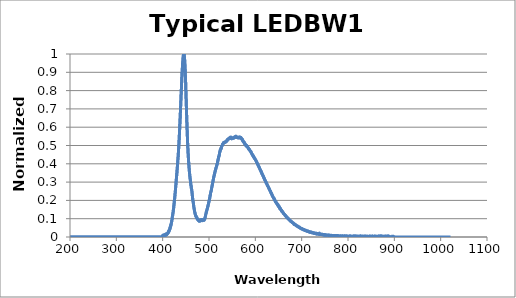
| Category | Normalized Intensity |
|---|---|
| 196.74042 | 0 |
| 196.94817 | 0 |
| 197.15593 | 0 |
| 197.36369 | 0 |
| 197.57147 | 0 |
| 197.77927 | 0 |
| 197.98708 | 0 |
| 198.19489 | 0 |
| 198.40271 | 0 |
| 198.61053 | 0 |
| 198.81839 | 0 |
| 199.02625 | 0 |
| 199.2341 | 0 |
| 199.44199 | 0 |
| 199.64987 | 0 |
| 199.85777 | 0 |
| 200.06567 | 0 |
| 200.27359 | 0 |
| 200.48152 | 0 |
| 200.68947 | 0 |
| 200.89742 | 0 |
| 201.10538 | 0 |
| 201.31335 | 0 |
| 201.52133 | 0 |
| 201.72932 | 0 |
| 201.93733 | 0 |
| 202.14536 | 0 |
| 202.35338 | 0 |
| 202.56142 | 0 |
| 202.76945 | 0 |
| 202.97751 | 0 |
| 203.18558 | 0 |
| 203.39366 | 0 |
| 203.60175 | 0 |
| 203.80985 | 0 |
| 204.01796 | 0 |
| 204.22607 | 0 |
| 204.43422 | 0 |
| 204.64235 | 0 |
| 204.85051 | 0 |
| 205.05867 | 0 |
| 205.26685 | 0 |
| 205.47504 | 0 |
| 205.68323 | 0 |
| 205.89143 | 0 |
| 206.09964 | 0 |
| 206.30788 | 0 |
| 206.51611 | 0 |
| 206.72437 | 0 |
| 206.93262 | 0 |
| 207.14088 | 0 |
| 207.34917 | 0 |
| 207.55746 | 0 |
| 207.76576 | 0 |
| 207.97408 | 0 |
| 208.18239 | 0 |
| 208.39073 | 0 |
| 208.59908 | 0 |
| 208.80743 | 0 |
| 209.01579 | 0 |
| 209.22417 | 0 |
| 209.43256 | 0 |
| 209.64095 | 0 |
| 209.84937 | 0 |
| 210.05777 | 0 |
| 210.2662 | 0 |
| 210.47464 | 0 |
| 210.68309 | 0 |
| 210.89156 | 0 |
| 211.10002 | 0 |
| 211.3085 | 0 |
| 211.517 | 0 |
| 211.72551 | 0 |
| 211.93402 | 0 |
| 212.14255 | 0 |
| 212.35107 | 0 |
| 212.55962 | 0 |
| 212.76817 | 0 |
| 212.97675 | 0 |
| 213.18532 | 0 |
| 213.39391 | 0 |
| 213.60251 | 0 |
| 213.81111 | 0 |
| 214.01973 | 0 |
| 214.22836 | 0 |
| 214.43701 | 0 |
| 214.64566 | 0 |
| 214.85432 | 0 |
| 215.06299 | 0 |
| 215.27167 | 0 |
| 215.48036 | 0 |
| 215.68907 | 0 |
| 215.89778 | 0 |
| 216.10651 | 0 |
| 216.31525 | 0 |
| 216.52399 | 0 |
| 216.73276 | 0 |
| 216.94151 | 0 |
| 217.1503 | 0 |
| 217.35909 | 0 |
| 217.56789 | 0 |
| 217.77669 | 0 |
| 217.98552 | 0 |
| 218.19435 | 0 |
| 218.40318 | 0 |
| 218.61205 | 0 |
| 218.82091 | 0 |
| 219.02979 | 0 |
| 219.23866 | 0 |
| 219.44756 | 0 |
| 219.65646 | 0 |
| 219.86537 | 0 |
| 220.07431 | 0 |
| 220.28325 | 0 |
| 220.49219 | 0 |
| 220.70114 | 0 |
| 220.91011 | 0 |
| 221.11909 | 0 |
| 221.32808 | 0 |
| 221.53708 | 0 |
| 221.74609 | 0 |
| 221.95512 | 0 |
| 222.16415 | 0 |
| 222.3732 | 0 |
| 222.58224 | 0 |
| 222.79131 | 0 |
| 223.00038 | 0 |
| 223.20947 | 0 |
| 223.41856 | 0 |
| 223.62767 | 0 |
| 223.83679 | 0 |
| 224.04591 | 0 |
| 224.25505 | 0 |
| 224.4642 | 0 |
| 224.67337 | 0 |
| 224.88254 | 0 |
| 225.09172 | 0 |
| 225.3009 | 0 |
| 225.5101 | 0 |
| 225.71931 | 0 |
| 225.92854 | 0 |
| 226.13777 | 0 |
| 226.34702 | 0 |
| 226.55627 | 0 |
| 226.76553 | 0 |
| 226.97481 | 0 |
| 227.1841 | 0 |
| 227.39339 | 0 |
| 227.60271 | 0 |
| 227.81201 | 0 |
| 228.02135 | 0 |
| 228.23068 | 0 |
| 228.44003 | 0 |
| 228.6494 | 0 |
| 228.85876 | 0 |
| 229.06815 | 0 |
| 229.27754 | 0 |
| 229.48694 | 0 |
| 229.69635 | 0 |
| 229.90578 | 0 |
| 230.1152 | 0 |
| 230.32466 | 0 |
| 230.5341 | 0 |
| 230.74358 | 0 |
| 230.95305 | 0 |
| 231.16254 | 0 |
| 231.37204 | 0 |
| 231.58154 | 0 |
| 231.79106 | 0 |
| 232.0006 | 0 |
| 232.21013 | 0 |
| 232.41968 | 0 |
| 232.62924 | 0 |
| 232.83881 | 0 |
| 233.04839 | 0 |
| 233.25798 | 0 |
| 233.46759 | 0 |
| 233.6772 | 0 |
| 233.88683 | 0 |
| 234.09647 | 0 |
| 234.30611 | 0 |
| 234.51576 | 0 |
| 234.72543 | 0 |
| 234.9351 | 0 |
| 235.14479 | 0 |
| 235.35449 | 0 |
| 235.56419 | 0 |
| 235.77391 | 0 |
| 235.98364 | 0 |
| 236.19339 | 0 |
| 236.40314 | 0 |
| 236.6129 | 0 |
| 236.82266 | 0 |
| 237.03246 | 0 |
| 237.24225 | 0 |
| 237.45204 | 0 |
| 237.66187 | 0 |
| 237.87169 | 0 |
| 238.08151 | 0 |
| 238.29137 | 0 |
| 238.50122 | 0 |
| 238.71109 | 0 |
| 238.92096 | 0 |
| 239.13084 | 0 |
| 239.34074 | 0 |
| 239.55066 | 0 |
| 239.76057 | 0 |
| 239.9705 | 0 |
| 240.18045 | 0 |
| 240.3904 | 0 |
| 240.60036 | 0 |
| 240.81033 | 0 |
| 241.02031 | 0 |
| 241.2303 | 0 |
| 241.44031 | 0 |
| 241.65031 | 0 |
| 241.86035 | 0 |
| 242.07037 | 0 |
| 242.28043 | 0 |
| 242.49048 | 0 |
| 242.70055 | 0 |
| 242.91063 | 0 |
| 243.12071 | 0 |
| 243.33081 | 0 |
| 243.54092 | 0 |
| 243.75104 | 0 |
| 243.96117 | 0 |
| 244.17131 | 0 |
| 244.38145 | 0 |
| 244.59163 | 0 |
| 244.80179 | 0 |
| 245.01198 | 0 |
| 245.22217 | 0 |
| 245.43237 | 0 |
| 245.64259 | 0 |
| 245.85281 | 0 |
| 246.06305 | 0 |
| 246.27328 | 0 |
| 246.48355 | 0 |
| 246.69382 | 0 |
| 246.9041 | 0 |
| 247.11438 | 0 |
| 247.32468 | 0 |
| 247.53499 | 0 |
| 247.7453 | 0 |
| 247.95564 | 0 |
| 248.16597 | 0 |
| 248.37633 | 0 |
| 248.58669 | 0 |
| 248.79706 | 0 |
| 249.00745 | 0 |
| 249.21783 | 0 |
| 249.42824 | 0 |
| 249.63866 | 0 |
| 249.84908 | 0 |
| 250.05951 | 0 |
| 250.26996 | 0 |
| 250.48041 | 0 |
| 250.69087 | 0 |
| 250.90135 | 0 |
| 251.11185 | 0 |
| 251.32234 | 0 |
| 251.53285 | 0 |
| 251.74336 | 0 |
| 251.9539 | 0 |
| 252.16444 | 0 |
| 252.37498 | 0 |
| 252.58556 | 0 |
| 252.79613 | 0 |
| 253.0067 | 0 |
| 253.2173 | 0 |
| 253.4279 | 0 |
| 253.63852 | 0 |
| 253.84914 | 0 |
| 254.05977 | 0 |
| 254.27042 | 0 |
| 254.48108 | 0 |
| 254.69174 | 0 |
| 254.90242 | 0 |
| 255.1131 | 0 |
| 255.32381 | 0 |
| 255.53452 | 0 |
| 255.74522 | 0 |
| 255.95596 | 0 |
| 256.16669 | 0 |
| 256.37744 | 0 |
| 256.5882 | 0 |
| 256.79898 | 0 |
| 257.00977 | 0 |
| 257.22055 | 0 |
| 257.43137 | 0 |
| 257.64218 | 0 |
| 257.853 | 0 |
| 258.06381 | 0 |
| 258.27466 | 0 |
| 258.48553 | 0 |
| 258.69638 | 0 |
| 258.90726 | 0 |
| 259.11816 | 0 |
| 259.32904 | 0 |
| 259.53995 | 0 |
| 259.75088 | 0 |
| 259.96182 | 0 |
| 260.17276 | 0 |
| 260.3837 | 0 |
| 260.59467 | 0 |
| 260.80563 | 0 |
| 261.0166 | 0 |
| 261.2276 | 0 |
| 261.4386 | 0 |
| 261.64963 | 0 |
| 261.86063 | 0 |
| 262.07169 | 0 |
| 262.28271 | 0 |
| 262.49377 | 0 |
| 262.70483 | 0 |
| 262.91592 | 0 |
| 263.12698 | 0 |
| 263.3381 | 0 |
| 263.54919 | 0 |
| 263.76031 | 0 |
| 263.97144 | 0 |
| 264.18259 | 0 |
| 264.39374 | 0 |
| 264.60489 | 0 |
| 264.81607 | 0 |
| 265.02725 | 0 |
| 265.23843 | 0 |
| 265.44965 | 0 |
| 265.66086 | 0 |
| 265.87207 | 0 |
| 266.08331 | 0 |
| 266.29456 | 0 |
| 266.5058 | 0 |
| 266.71707 | 0 |
| 266.92834 | 0 |
| 267.13962 | 0 |
| 267.35092 | 0 |
| 267.56223 | 0 |
| 267.77353 | 0 |
| 267.98486 | 0 |
| 268.1962 | 0 |
| 268.40756 | 0 |
| 268.61893 | 0 |
| 268.83029 | 0 |
| 269.04166 | 0 |
| 269.25305 | 0 |
| 269.46445 | 0 |
| 269.67587 | 0 |
| 269.8873 | 0 |
| 270.09872 | 0 |
| 270.31015 | 0 |
| 270.52161 | 0 |
| 270.73306 | 0 |
| 270.94455 | 0 |
| 271.15604 | 0 |
| 271.36752 | 0 |
| 271.57904 | 0 |
| 271.79056 | 0 |
| 272.00208 | 0 |
| 272.21362 | 0 |
| 272.42517 | 0 |
| 272.63672 | 0 |
| 272.8483 | 0 |
| 273.05988 | 0 |
| 273.27145 | 0 |
| 273.48306 | 0 |
| 273.69467 | 0 |
| 273.90628 | 0 |
| 274.11792 | 0 |
| 274.32956 | 0 |
| 274.5412 | 0 |
| 274.75287 | 0 |
| 274.96454 | 0 |
| 275.17624 | 0 |
| 275.38791 | 0 |
| 275.59961 | 0 |
| 275.81134 | 0 |
| 276.02307 | 0 |
| 276.2348 | 0 |
| 276.44653 | 0 |
| 276.65829 | 0 |
| 276.87006 | 0 |
| 277.08185 | 0 |
| 277.29364 | 0 |
| 277.50543 | 0 |
| 277.71722 | 0 |
| 277.92905 | 0 |
| 278.1409 | 0 |
| 278.35272 | 0 |
| 278.56458 | 0 |
| 278.77643 | 0 |
| 278.98831 | 0 |
| 279.2002 | 0 |
| 279.41208 | 0 |
| 279.62399 | 0 |
| 279.83591 | 0 |
| 280.04782 | 0 |
| 280.25977 | 0 |
| 280.47171 | 0 |
| 280.68365 | 0 |
| 280.89563 | 0 |
| 281.1076 | 0 |
| 281.31958 | 0 |
| 281.53159 | 0 |
| 281.74359 | 0 |
| 281.9556 | 0 |
| 282.16763 | 0 |
| 282.37967 | 0 |
| 282.59174 | 0 |
| 282.80377 | 0 |
| 283.01584 | 0 |
| 283.22794 | 0 |
| 283.44003 | 0 |
| 283.65213 | 0 |
| 283.86423 | 0 |
| 284.07635 | 0 |
| 284.28848 | 0 |
| 284.50064 | 0 |
| 284.7128 | 0 |
| 284.92496 | 0 |
| 285.13712 | 0 |
| 285.3493 | 0 |
| 285.56149 | 0 |
| 285.77371 | 0 |
| 285.98593 | 0 |
| 286.19815 | 0 |
| 286.4104 | 0 |
| 286.62265 | 0 |
| 286.8349 | 0 |
| 287.04715 | 0 |
| 287.25943 | 0 |
| 287.47174 | 0 |
| 287.68402 | 0 |
| 287.89633 | 0 |
| 288.10867 | 0 |
| 288.32098 | 0 |
| 288.53333 | 0 |
| 288.7457 | 0 |
| 288.95804 | 0 |
| 289.17041 | 0 |
| 289.38281 | 0 |
| 289.59518 | 0 |
| 289.80759 | 0 |
| 290.02002 | 0 |
| 290.23245 | 0 |
| 290.44489 | 0 |
| 290.65732 | 0 |
| 290.86978 | 0 |
| 291.08224 | 0 |
| 291.29471 | 0 |
| 291.5072 | 0 |
| 291.7197 | 0 |
| 291.93222 | 0 |
| 292.14474 | 0 |
| 292.35727 | 0 |
| 292.56979 | 0 |
| 292.78235 | 0 |
| 292.9949 | 0 |
| 293.20749 | 0 |
| 293.42007 | 0 |
| 293.63266 | 0 |
| 293.84525 | 0 |
| 294.05786 | 0 |
| 294.27048 | 0 |
| 294.48312 | 0 |
| 294.69577 | 0 |
| 294.90842 | 0 |
| 295.12109 | 0 |
| 295.33377 | 0 |
| 295.54645 | 0 |
| 295.75916 | 0 |
| 295.97186 | 0 |
| 296.18457 | 0 |
| 296.39728 | 0 |
| 296.61002 | 0 |
| 296.82278 | 0 |
| 297.03552 | 0 |
| 297.24829 | 0 |
| 297.46109 | 0 |
| 297.67386 | 0 |
| 297.88669 | 0 |
| 298.09949 | 0 |
| 298.31232 | 0 |
| 298.52515 | 0 |
| 298.73798 | 0 |
| 298.95084 | 0 |
| 299.1637 | 0 |
| 299.37656 | 0 |
| 299.58945 | 0 |
| 299.80234 | 0 |
| 300.01526 | 0 |
| 300.22815 | 0 |
| 300.44107 | 0 |
| 300.65402 | 0 |
| 300.86697 | 0 |
| 301.07993 | 0 |
| 301.29288 | 0 |
| 301.50586 | 0 |
| 301.71884 | 0 |
| 301.93185 | 0 |
| 302.14487 | 0 |
| 302.35788 | 0 |
| 302.57089 | 0 |
| 302.78394 | 0 |
| 302.99701 | 0 |
| 303.21005 | 0 |
| 303.42313 | 0 |
| 303.6362 | 0 |
| 303.8493 | 0 |
| 304.06241 | 0 |
| 304.27551 | 0 |
| 304.48865 | 0 |
| 304.70178 | 0 |
| 304.91492 | 0 |
| 305.12805 | 0 |
| 305.34122 | 0 |
| 305.55441 | 0 |
| 305.76758 | 0 |
| 305.98077 | 0 |
| 306.194 | 0 |
| 306.4072 | 0 |
| 306.62042 | 0 |
| 306.83368 | 0 |
| 307.04691 | 0 |
| 307.26016 | 0 |
| 307.47345 | 0 |
| 307.68671 | 0 |
| 307.89999 | 0 |
| 308.11331 | 0 |
| 308.32663 | 0 |
| 308.53995 | 0 |
| 308.75327 | 0 |
| 308.96661 | 0 |
| 309.17996 | 0 |
| 309.39331 | 0 |
| 309.60669 | 0 |
| 309.82007 | 0 |
| 310.03348 | 0 |
| 310.24689 | 0 |
| 310.4603 | 0 |
| 310.67371 | 0 |
| 310.88715 | 0 |
| 311.10059 | 0 |
| 311.31406 | 0 |
| 311.5275 | 0 |
| 311.741 | 0 |
| 311.95447 | 0 |
| 312.16797 | 0 |
| 312.38147 | 0 |
| 312.595 | 0 |
| 312.80853 | 0 |
| 313.02206 | 0 |
| 313.2356 | 0 |
| 313.44916 | 0 |
| 313.66272 | 0 |
| 313.87631 | 0 |
| 314.0899 | 0 |
| 314.3035 | 0 |
| 314.51712 | 0 |
| 314.73074 | 0 |
| 314.94437 | 0 |
| 315.15802 | 0 |
| 315.37167 | 0 |
| 315.58533 | 0 |
| 315.79901 | 0 |
| 316.0127 | 0 |
| 316.22638 | 0 |
| 316.44009 | 0 |
| 316.65381 | 0 |
| 316.86752 | 0 |
| 317.08127 | 0 |
| 317.29501 | 0 |
| 317.50876 | 0 |
| 317.72253 | 0 |
| 317.93631 | 0 |
| 318.15009 | 0 |
| 318.36389 | 0 |
| 318.5777 | 0 |
| 318.7915 | 0 |
| 319.00534 | 0 |
| 319.21918 | 0 |
| 319.43301 | 0 |
| 319.64688 | 0 |
| 319.86075 | 0 |
| 320.07465 | 0 |
| 320.28851 | 0 |
| 320.50244 | 0 |
| 320.71634 | 0 |
| 320.93027 | 0 |
| 321.1442 | 0 |
| 321.35812 | 0 |
| 321.57208 | 0 |
| 321.78604 | 0 |
| 322.00003 | 0 |
| 322.21402 | 0 |
| 322.42801 | 0 |
| 322.642 | 0 |
| 322.85602 | 0 |
| 323.07004 | 0 |
| 323.28409 | 0 |
| 323.49814 | 0 |
| 323.71219 | 0 |
| 323.92627 | 0 |
| 324.14035 | 0 |
| 324.35443 | 0 |
| 324.56851 | 0 |
| 324.78262 | 0 |
| 324.99673 | 0 |
| 325.21088 | 0 |
| 325.42502 | 0 |
| 325.63916 | 0 |
| 325.85333 | 0 |
| 326.0675 | 0 |
| 326.28168 | 0 |
| 326.49588 | 0 |
| 326.71008 | 0 |
| 326.92429 | 0 |
| 327.13852 | 0 |
| 327.35275 | 0 |
| 327.56699 | 0 |
| 327.78122 | 0 |
| 327.99548 | 0 |
| 328.20978 | 0 |
| 328.42404 | 0 |
| 328.63834 | 0 |
| 328.85266 | 0 |
| 329.06699 | 0 |
| 329.28131 | 0 |
| 329.49564 | 0 |
| 329.70999 | 0 |
| 329.92435 | 0 |
| 330.1387 | 0 |
| 330.35309 | 0 |
| 330.56747 | 0 |
| 330.78186 | 0 |
| 330.99628 | 0 |
| 331.21069 | 0 |
| 331.42511 | 0 |
| 331.63956 | 0 |
| 331.854 | 0 |
| 332.06848 | 0 |
| 332.28296 | 0 |
| 332.49744 | 0 |
| 332.71191 | 0 |
| 332.92642 | 0 |
| 333.14093 | 0 |
| 333.35544 | 0 |
| 333.56998 | 0 |
| 333.78452 | 0 |
| 333.99908 | 0 |
| 334.21365 | 0 |
| 334.42822 | 0 |
| 334.64279 | 0 |
| 334.85739 | 0 |
| 335.07199 | 0 |
| 335.28662 | 0 |
| 335.50125 | 0 |
| 335.71588 | 0 |
| 335.93051 | 0 |
| 336.14517 | 0 |
| 336.35986 | 0 |
| 336.57452 | 0 |
| 336.78922 | 0 |
| 337.00391 | 0 |
| 337.21863 | 0 |
| 337.43335 | 0 |
| 337.64807 | 0 |
| 337.86279 | 0 |
| 338.07755 | 0 |
| 338.29233 | 0 |
| 338.50708 | 0 |
| 338.72186 | 0 |
| 338.93665 | 0 |
| 339.15146 | 0 |
| 339.36627 | 0 |
| 339.58109 | 0 |
| 339.79593 | 0 |
| 340.01077 | 0 |
| 340.22562 | 0 |
| 340.44049 | 0 |
| 340.65537 | 0 |
| 340.87024 | 0 |
| 341.08514 | 0 |
| 341.30005 | 0 |
| 341.51495 | 0 |
| 341.72989 | 0 |
| 341.94482 | 0 |
| 342.15976 | 0 |
| 342.37473 | 0 |
| 342.58969 | 0 |
| 342.80466 | 0 |
| 343.01965 | 0 |
| 343.23465 | 0 |
| 343.44965 | 0 |
| 343.66467 | 0 |
| 343.8797 | 0 |
| 344.09473 | 0 |
| 344.30978 | 0 |
| 344.52484 | 0 |
| 344.73993 | 0 |
| 344.95499 | 0 |
| 345.17007 | 0 |
| 345.38519 | 0 |
| 345.60028 | 0 |
| 345.81543 | 0 |
| 346.03055 | 0 |
| 346.2457 | 0 |
| 346.46085 | 0 |
| 346.67599 | 0 |
| 346.89117 | 0 |
| 347.10635 | 0 |
| 347.32156 | 0 |
| 347.53674 | 0 |
| 347.75198 | 0 |
| 347.96719 | 0 |
| 348.18243 | 0 |
| 348.39767 | 0 |
| 348.61291 | 0 |
| 348.82819 | 0 |
| 349.04346 | 0 |
| 349.25876 | 0 |
| 349.47406 | 0 |
| 349.68936 | 0 |
| 349.90466 | 0 |
| 350.12 | 0 |
| 350.33533 | 0 |
| 350.55069 | 0 |
| 350.76605 | 0 |
| 350.98141 | 0 |
| 351.19681 | 0 |
| 351.41217 | 0 |
| 351.62759 | 0 |
| 351.84299 | 0 |
| 352.05841 | 0 |
| 352.27383 | 0 |
| 352.48929 | 0 |
| 352.70474 | 0 |
| 352.9202 | 0 |
| 353.13565 | 0 |
| 353.35114 | 0 |
| 353.56665 | 0 |
| 353.78213 | 0 |
| 353.99765 | 0 |
| 354.21317 | 0 |
| 354.42871 | 0 |
| 354.64426 | 0 |
| 354.8598 | 0 |
| 355.07538 | 0 |
| 355.29095 | 0 |
| 355.50653 | 0 |
| 355.72214 | 0 |
| 355.93774 | 0 |
| 356.15335 | 0 |
| 356.36896 | 0 |
| 356.58459 | 0 |
| 356.80026 | 0 |
| 357.0159 | 0 |
| 357.23157 | 0 |
| 357.44727 | 0 |
| 357.66293 | 0 |
| 357.87863 | 0 |
| 358.09436 | 0 |
| 358.31006 | 0 |
| 358.52579 | 0 |
| 358.74155 | 0 |
| 358.95728 | 0 |
| 359.17303 | 0 |
| 359.38882 | 0 |
| 359.60458 | 0 |
| 359.82037 | 0 |
| 360.03619 | 0 |
| 360.25198 | 0 |
| 360.4678 | 0 |
| 360.68365 | 0 |
| 360.89948 | 0 |
| 361.11536 | 0 |
| 361.33121 | 0 |
| 361.54709 | 0 |
| 361.76297 | 0 |
| 361.97885 | 0 |
| 362.19476 | 0 |
| 362.41068 | 0 |
| 362.62659 | 0 |
| 362.84253 | 0 |
| 363.05847 | 0 |
| 363.27441 | 0 |
| 363.49039 | 0 |
| 363.70636 | 0 |
| 363.92236 | 0 |
| 364.13834 | 0 |
| 364.35437 | 0 |
| 364.57037 | 0 |
| 364.78641 | 0 |
| 365.00244 | 0 |
| 365.21848 | 0 |
| 365.43454 | 0 |
| 365.6506 | 0 |
| 365.8667 | 0 |
| 366.08276 | 0 |
| 366.29886 | 0 |
| 366.51498 | 0 |
| 366.73111 | 0 |
| 366.94724 | 0 |
| 367.16336 | 0 |
| 367.37952 | 0 |
| 367.59567 | 0 |
| 367.81186 | 0 |
| 368.02805 | 0 |
| 368.24423 | 0 |
| 368.46042 | 0 |
| 368.67664 | 0 |
| 368.89285 | 0 |
| 369.1091 | 0 |
| 369.32532 | 0 |
| 369.5416 | 0 |
| 369.75784 | 0 |
| 369.97412 | 0 |
| 370.1904 | 0 |
| 370.40671 | 0 |
| 370.62302 | 0 |
| 370.83932 | 0 |
| 371.05563 | 0 |
| 371.27197 | 0 |
| 371.48831 | 0 |
| 371.70468 | 0 |
| 371.92105 | 0 |
| 372.13742 | 0 |
| 372.35379 | 0 |
| 372.57019 | 0 |
| 372.78659 | 0 |
| 373.00302 | 0 |
| 373.21945 | 0 |
| 373.43588 | 0 |
| 373.65234 | 0 |
| 373.8688 | 0 |
| 374.08527 | 0 |
| 374.30173 | 0 |
| 374.51822 | 0 |
| 374.73471 | 0 |
| 374.95123 | 0 |
| 375.16776 | 0 |
| 375.38428 | 0 |
| 375.60083 | 0 |
| 375.81738 | 0 |
| 376.03394 | 0 |
| 376.25049 | 0 |
| 376.46707 | 0 |
| 376.68369 | 0 |
| 376.90027 | 0 |
| 377.11688 | 0 |
| 377.3335 | 0 |
| 377.55014 | 0 |
| 377.76678 | 0 |
| 377.98343 | 0 |
| 378.2001 | 0 |
| 378.41678 | 0 |
| 378.63345 | 0 |
| 378.85016 | 0 |
| 379.06686 | 0 |
| 379.28357 | 0 |
| 379.50027 | 0 |
| 379.71701 | 0 |
| 379.93378 | 0 |
| 380.15051 | 0 |
| 380.36728 | 0 |
| 380.58408 | 0 |
| 380.80084 | 0 |
| 381.01764 | 0 |
| 381.23444 | 0 |
| 381.45126 | 0 |
| 381.66809 | 0 |
| 381.88492 | 0 |
| 382.10178 | 0 |
| 382.31863 | 0 |
| 382.53549 | 0 |
| 382.75238 | 0 |
| 382.96927 | 0 |
| 383.18616 | 0 |
| 383.40308 | 0 |
| 383.62 | 0 |
| 383.83691 | 0 |
| 384.05386 | 0 |
| 384.27081 | 0 |
| 384.48776 | 0 |
| 384.70474 | 0 |
| 384.92172 | 0 |
| 385.1387 | 0 |
| 385.35571 | 0 |
| 385.57272 | 0 |
| 385.78973 | 0 |
| 386.00677 | 0 |
| 386.22382 | 0 |
| 386.44086 | 0 |
| 386.65793 | 0 |
| 386.875 | 0 |
| 387.09207 | 0 |
| 387.30917 | 0 |
| 387.52628 | 0 |
| 387.74338 | 0 |
| 387.96051 | 0 |
| 388.17764 | 0 |
| 388.39478 | 0 |
| 388.61194 | 0 |
| 388.8291 | 0 |
| 389.0463 | 0 |
| 389.26346 | 0 |
| 389.48065 | 0 |
| 389.69788 | 0 |
| 389.91507 | 0 |
| 390.13229 | 0 |
| 390.34955 | 0 |
| 390.56677 | 0 |
| 390.78403 | 0 |
| 391.00131 | 0 |
| 391.2186 | 0 |
| 391.43588 | 0 |
| 391.65317 | 0 |
| 391.87048 | 0 |
| 392.0878 | 0 |
| 392.30511 | 0 |
| 392.52246 | 0 |
| 392.73981 | 0 |
| 392.95715 | 0 |
| 393.17453 | 0 |
| 393.39191 | 0 |
| 393.60931 | 0 |
| 393.82669 | 0 |
| 394.0441 | 0 |
| 394.26154 | 0 |
| 394.47894 | 0 |
| 394.69641 | 0 |
| 394.91385 | 0 |
| 395.13132 | 0 |
| 395.34879 | 0 |
| 395.56625 | 0 |
| 395.78375 | 0 |
| 396.00125 | 0 |
| 396.21875 | 0 |
| 396.43628 | 0 |
| 396.65381 | 0 |
| 396.87137 | 0 |
| 397.0889 | 0 |
| 397.30646 | 0 |
| 397.52405 | 0 |
| 397.74164 | 0 |
| 397.95923 | 0 |
| 398.17682 | 0 |
| 398.39444 | 0 |
| 398.61206 | 0 |
| 398.82968 | 0 |
| 399.04733 | 0 |
| 399.26498 | 0 |
| 399.48267 | 0 |
| 399.70032 | 0 |
| 399.918 | 0 |
| 400.13571 | 0.01 |
| 400.35342 | 0.007 |
| 400.57114 | 0.01 |
| 400.78885 | 0.005 |
| 401.00659 | 0.008 |
| 401.22433 | 0.006 |
| 401.44208 | 0.01 |
| 401.65985 | 0.005 |
| 401.87762 | 0.01 |
| 402.09543 | 0.006 |
| 402.31323 | 0.01 |
| 402.53104 | 0.005 |
| 402.74884 | 0.012 |
| 402.96667 | 0.007 |
| 403.18451 | 0.012 |
| 403.40234 | 0.009 |
| 403.62021 | 0.01 |
| 403.83807 | 0.008 |
| 404.05597 | 0.011 |
| 404.27383 | 0.011 |
| 404.49176 | 0.011 |
| 404.70966 | 0.009 |
| 404.92758 | 0.012 |
| 405.14551 | 0.009 |
| 405.36343 | 0.013 |
| 405.58139 | 0.014 |
| 405.79935 | 0.011 |
| 406.01733 | 0.012 |
| 406.23529 | 0.016 |
| 406.45331 | 0.012 |
| 406.6713 | 0.017 |
| 406.88931 | 0.01 |
| 407.10733 | 0.013 |
| 407.32535 | 0.011 |
| 407.5434 | 0.015 |
| 407.76144 | 0.011 |
| 407.97952 | 0.014 |
| 408.19757 | 0.017 |
| 408.41568 | 0.013 |
| 408.63376 | 0.013 |
| 408.85187 | 0.015 |
| 409.06998 | 0.017 |
| 409.28809 | 0.018 |
| 409.50623 | 0.018 |
| 409.72437 | 0.017 |
| 409.94254 | 0.019 |
| 410.16068 | 0.017 |
| 410.37888 | 0.02 |
| 410.59705 | 0.021 |
| 410.81525 | 0.022 |
| 411.03345 | 0.02 |
| 411.25165 | 0.022 |
| 411.46988 | 0.021 |
| 411.68811 | 0.026 |
| 411.90637 | 0.024 |
| 412.1246 | 0.026 |
| 412.3429 | 0.023 |
| 412.56116 | 0.031 |
| 412.77945 | 0.028 |
| 412.99774 | 0.03 |
| 413.21603 | 0.03 |
| 413.43436 | 0.032 |
| 413.65268 | 0.03 |
| 413.87103 | 0.035 |
| 414.08939 | 0.034 |
| 414.30774 | 0.04 |
| 414.52609 | 0.038 |
| 414.74448 | 0.041 |
| 414.96286 | 0.041 |
| 415.18124 | 0.045 |
| 415.39966 | 0.045 |
| 415.61807 | 0.044 |
| 415.83652 | 0.048 |
| 416.05496 | 0.052 |
| 416.27341 | 0.049 |
| 416.49185 | 0.056 |
| 416.71033 | 0.054 |
| 416.9288 | 0.061 |
| 417.14728 | 0.056 |
| 417.36578 | 0.065 |
| 417.58429 | 0.063 |
| 417.80283 | 0.067 |
| 418.02136 | 0.065 |
| 418.2399 | 0.072 |
| 418.45844 | 0.073 |
| 418.677 | 0.075 |
| 418.89557 | 0.078 |
| 419.11414 | 0.081 |
| 419.33273 | 0.082 |
| 419.55133 | 0.088 |
| 419.76996 | 0.089 |
| 419.98856 | 0.096 |
| 420.20721 | 0.095 |
| 420.42584 | 0.098 |
| 420.6445 | 0.1 |
| 420.86316 | 0.108 |
| 421.08182 | 0.114 |
| 421.30051 | 0.113 |
| 421.5192 | 0.118 |
| 421.73791 | 0.12 |
| 421.9566 | 0.127 |
| 422.17532 | 0.13 |
| 422.39407 | 0.133 |
| 422.61282 | 0.137 |
| 422.83157 | 0.144 |
| 423.05032 | 0.147 |
| 423.2691 | 0.149 |
| 423.48788 | 0.156 |
| 423.70666 | 0.158 |
| 423.92548 | 0.166 |
| 424.14429 | 0.171 |
| 424.36313 | 0.175 |
| 424.58197 | 0.181 |
| 424.80081 | 0.186 |
| 425.01965 | 0.189 |
| 425.23853 | 0.198 |
| 425.4574 | 0.202 |
| 425.67627 | 0.209 |
| 425.89517 | 0.211 |
| 426.11407 | 0.219 |
| 426.33301 | 0.222 |
| 426.55191 | 0.23 |
| 426.77084 | 0.232 |
| 426.98981 | 0.243 |
| 427.20877 | 0.247 |
| 427.42773 | 0.254 |
| 427.6467 | 0.259 |
| 427.86569 | 0.268 |
| 428.08469 | 0.27 |
| 428.30368 | 0.281 |
| 428.52271 | 0.285 |
| 428.74173 | 0.289 |
| 428.96075 | 0.299 |
| 429.17981 | 0.306 |
| 429.39886 | 0.309 |
| 429.61795 | 0.319 |
| 429.83701 | 0.326 |
| 430.05609 | 0.332 |
| 430.27521 | 0.339 |
| 430.49432 | 0.345 |
| 430.71344 | 0.35 |
| 430.93256 | 0.361 |
| 431.1517 | 0.366 |
| 431.37085 | 0.372 |
| 431.59 | 0.377 |
| 431.80917 | 0.387 |
| 432.02835 | 0.391 |
| 432.24753 | 0.405 |
| 432.46674 | 0.405 |
| 432.68594 | 0.417 |
| 432.90515 | 0.424 |
| 433.12439 | 0.433 |
| 433.34363 | 0.437 |
| 433.5629 | 0.448 |
| 433.78213 | 0.455 |
| 434.0014 | 0.464 |
| 434.2207 | 0.471 |
| 434.43997 | 0.482 |
| 434.65927 | 0.49 |
| 434.8786 | 0.501 |
| 435.09793 | 0.511 |
| 435.31726 | 0.523 |
| 435.53659 | 0.53 |
| 435.75595 | 0.543 |
| 435.97531 | 0.553 |
| 436.19467 | 0.567 |
| 436.41406 | 0.58 |
| 436.63345 | 0.589 |
| 436.85284 | 0.599 |
| 437.07227 | 0.613 |
| 437.29169 | 0.624 |
| 437.51111 | 0.638 |
| 437.73056 | 0.65 |
| 437.95001 | 0.666 |
| 438.16946 | 0.675 |
| 438.38895 | 0.692 |
| 438.60843 | 0.702 |
| 438.82791 | 0.718 |
| 439.04742 | 0.728 |
| 439.26694 | 0.744 |
| 439.48645 | 0.756 |
| 439.70599 | 0.772 |
| 439.92554 | 0.782 |
| 440.14508 | 0.799 |
| 440.36465 | 0.807 |
| 440.58423 | 0.823 |
| 440.8038 | 0.836 |
| 441.02341 | 0.849 |
| 441.24301 | 0.86 |
| 441.46262 | 0.874 |
| 441.68225 | 0.885 |
| 441.90189 | 0.897 |
| 442.12152 | 0.907 |
| 442.34119 | 0.921 |
| 442.56085 | 0.924 |
| 442.78052 | 0.949 |
| 443.00018 | 0.943 |
| 443.21988 | 0.955 |
| 443.43961 | 0.959 |
| 443.6593 | 0.964 |
| 443.87903 | 0.971 |
| 444.09879 | 0.978 |
| 444.31851 | 0.985 |
| 444.53827 | 0.988 |
| 444.75803 | 0.995 |
| 444.97781 | 0.997 |
| 445.1976 | 0.998 |
| 445.41739 | 0.997 |
| 445.63721 | 0.996 |
| 445.85703 | 1 |
| 446.07684 | 0.996 |
| 446.29669 | 0.997 |
| 446.51654 | 0.992 |
| 446.73639 | 0.989 |
| 446.95624 | 0.982 |
| 447.17612 | 0.977 |
| 447.39603 | 0.97 |
| 447.61591 | 0.959 |
| 447.83582 | 0.949 |
| 448.05573 | 0.943 |
| 448.27567 | 0.923 |
| 448.49561 | 0.917 |
| 448.71555 | 0.9 |
| 448.93552 | 0.888 |
| 449.15549 | 0.872 |
| 449.37546 | 0.859 |
| 449.59543 | 0.843 |
| 449.81543 | 0.826 |
| 450.03543 | 0.802 |
| 450.25546 | 0.79 |
| 450.47549 | 0.767 |
| 450.69553 | 0.751 |
| 450.91559 | 0.733 |
| 451.13562 | 0.716 |
| 451.35571 | 0.699 |
| 451.57578 | 0.682 |
| 451.79587 | 0.659 |
| 452.01596 | 0.643 |
| 452.23608 | 0.628 |
| 452.45621 | 0.611 |
| 452.67633 | 0.593 |
| 452.89645 | 0.58 |
| 453.11661 | 0.558 |
| 453.33676 | 0.549 |
| 453.55695 | 0.535 |
| 453.77713 | 0.521 |
| 453.99731 | 0.506 |
| 454.2175 | 0.496 |
| 454.43771 | 0.483 |
| 454.65793 | 0.474 |
| 454.87817 | 0.46 |
| 455.09842 | 0.449 |
| 455.31866 | 0.439 |
| 455.53891 | 0.432 |
| 455.75919 | 0.421 |
| 455.97946 | 0.413 |
| 456.19977 | 0.405 |
| 456.42007 | 0.4 |
| 456.64038 | 0.39 |
| 456.86069 | 0.385 |
| 457.08102 | 0.377 |
| 457.30136 | 0.373 |
| 457.52173 | 0.363 |
| 457.74207 | 0.355 |
| 457.96246 | 0.347 |
| 458.18283 | 0.345 |
| 458.40323 | 0.34 |
| 458.62363 | 0.335 |
| 458.84402 | 0.328 |
| 459.06445 | 0.324 |
| 459.28488 | 0.318 |
| 459.50534 | 0.313 |
| 459.72577 | 0.31 |
| 459.94623 | 0.307 |
| 460.16672 | 0.299 |
| 460.38721 | 0.297 |
| 460.6077 | 0.291 |
| 460.82819 | 0.288 |
| 461.04871 | 0.28 |
| 461.26923 | 0.282 |
| 461.48975 | 0.277 |
| 461.7103 | 0.275 |
| 461.93085 | 0.266 |
| 462.15143 | 0.265 |
| 462.37198 | 0.262 |
| 462.59256 | 0.26 |
| 462.81317 | 0.251 |
| 463.03375 | 0.251 |
| 463.25436 | 0.243 |
| 463.47501 | 0.24 |
| 463.69562 | 0.235 |
| 463.91629 | 0.233 |
| 464.13693 | 0.224 |
| 464.3576 | 0.219 |
| 464.57828 | 0.214 |
| 464.79895 | 0.21 |
| 465.01965 | 0.208 |
| 465.24036 | 0.2 |
| 465.46106 | 0.199 |
| 465.68179 | 0.194 |
| 465.90253 | 0.192 |
| 466.12326 | 0.185 |
| 466.34402 | 0.184 |
| 466.56479 | 0.178 |
| 466.78555 | 0.173 |
| 467.00635 | 0.17 |
| 467.22714 | 0.166 |
| 467.44794 | 0.161 |
| 467.66873 | 0.159 |
| 467.88956 | 0.156 |
| 468.11041 | 0.151 |
| 468.33124 | 0.148 |
| 468.55209 | 0.146 |
| 468.77298 | 0.141 |
| 468.99384 | 0.139 |
| 469.21472 | 0.136 |
| 469.43561 | 0.136 |
| 469.65652 | 0.132 |
| 469.87744 | 0.131 |
| 470.09836 | 0.125 |
| 470.31931 | 0.126 |
| 470.54025 | 0.124 |
| 470.7612 | 0.122 |
| 470.98215 | 0.12 |
| 471.20313 | 0.119 |
| 471.42413 | 0.114 |
| 471.64511 | 0.117 |
| 471.86612 | 0.112 |
| 472.08713 | 0.113 |
| 472.30817 | 0.11 |
| 472.52921 | 0.11 |
| 472.75024 | 0.108 |
| 472.97128 | 0.107 |
| 473.19235 | 0.105 |
| 473.41345 | 0.107 |
| 473.63452 | 0.104 |
| 473.85562 | 0.106 |
| 474.07672 | 0.102 |
| 474.29785 | 0.101 |
| 474.51895 | 0.099 |
| 474.74011 | 0.1 |
| 474.96124 | 0.098 |
| 475.1824 | 0.1 |
| 475.40356 | 0.097 |
| 475.62476 | 0.097 |
| 475.84592 | 0.094 |
| 476.06714 | 0.093 |
| 476.28833 | 0.095 |
| 476.50955 | 0.094 |
| 476.73077 | 0.092 |
| 476.952 | 0.094 |
| 477.17325 | 0.092 |
| 477.3945 | 0.091 |
| 477.61578 | 0.09 |
| 477.83707 | 0.093 |
| 478.05835 | 0.09 |
| 478.27963 | 0.091 |
| 478.50095 | 0.089 |
| 478.72226 | 0.089 |
| 478.94357 | 0.086 |
| 479.16492 | 0.09 |
| 479.38626 | 0.087 |
| 479.60764 | 0.088 |
| 479.82898 | 0.086 |
| 480.05035 | 0.088 |
| 480.27176 | 0.087 |
| 480.49316 | 0.088 |
| 480.71457 | 0.087 |
| 480.93597 | 0.088 |
| 481.15741 | 0.087 |
| 481.37885 | 0.088 |
| 481.60028 | 0.09 |
| 481.82175 | 0.091 |
| 482.04321 | 0.089 |
| 482.26468 | 0.093 |
| 482.48618 | 0.093 |
| 482.70767 | 0.094 |
| 482.92917 | 0.094 |
| 483.1507 | 0.094 |
| 483.37222 | 0.095 |
| 483.59375 | 0.095 |
| 483.81531 | 0.094 |
| 484.03687 | 0.095 |
| 484.25842 | 0.095 |
| 484.48001 | 0.094 |
| 484.7016 | 0.094 |
| 484.92319 | 0.092 |
| 485.14481 | 0.094 |
| 485.36642 | 0.094 |
| 485.58804 | 0.089 |
| 485.80966 | 0.093 |
| 486.03131 | 0.093 |
| 486.25299 | 0.093 |
| 486.47464 | 0.094 |
| 486.69632 | 0.094 |
| 486.918 | 0.092 |
| 487.13971 | 0.093 |
| 487.36142 | 0.092 |
| 487.58313 | 0.093 |
| 487.80487 | 0.092 |
| 488.02661 | 0.093 |
| 488.24835 | 0.093 |
| 488.47009 | 0.093 |
| 488.69186 | 0.091 |
| 488.91364 | 0.092 |
| 489.13544 | 0.092 |
| 489.35724 | 0.094 |
| 489.57904 | 0.093 |
| 489.80084 | 0.095 |
| 490.02267 | 0.094 |
| 490.24451 | 0.096 |
| 490.46637 | 0.097 |
| 490.68823 | 0.1 |
| 490.9101 | 0.099 |
| 491.13196 | 0.103 |
| 491.35385 | 0.104 |
| 491.57574 | 0.108 |
| 491.79767 | 0.109 |
| 492.01959 | 0.111 |
| 492.24152 | 0.114 |
| 492.46344 | 0.118 |
| 492.68539 | 0.118 |
| 492.90735 | 0.123 |
| 493.12933 | 0.124 |
| 493.35129 | 0.127 |
| 493.57327 | 0.129 |
| 493.79529 | 0.132 |
| 494.0173 | 0.133 |
| 494.23932 | 0.137 |
| 494.46133 | 0.137 |
| 494.68338 | 0.141 |
| 494.90543 | 0.143 |
| 495.12747 | 0.144 |
| 495.34955 | 0.146 |
| 495.57162 | 0.148 |
| 495.7937 | 0.149 |
| 496.01581 | 0.154 |
| 496.23791 | 0.154 |
| 496.46002 | 0.156 |
| 496.68216 | 0.159 |
| 496.9043 | 0.162 |
| 497.12643 | 0.163 |
| 497.3486 | 0.167 |
| 497.57077 | 0.168 |
| 497.79294 | 0.168 |
| 498.01514 | 0.173 |
| 498.23734 | 0.175 |
| 498.45953 | 0.175 |
| 498.68176 | 0.18 |
| 498.90399 | 0.182 |
| 499.12622 | 0.185 |
| 499.34848 | 0.187 |
| 499.57074 | 0.189 |
| 499.793 | 0.191 |
| 500.01526 | 0.196 |
| 500.23755 | 0.197 |
| 500.45987 | 0.2 |
| 500.68216 | 0.203 |
| 500.90448 | 0.206 |
| 501.1268 | 0.209 |
| 501.34915 | 0.212 |
| 501.5715 | 0.212 |
| 501.79385 | 0.216 |
| 502.0162 | 0.22 |
| 502.23859 | 0.226 |
| 502.461 | 0.225 |
| 502.68338 | 0.229 |
| 502.90579 | 0.232 |
| 503.1282 | 0.235 |
| 503.35065 | 0.235 |
| 503.57306 | 0.242 |
| 503.79553 | 0.244 |
| 504.01797 | 0.248 |
| 504.24045 | 0.248 |
| 504.46292 | 0.251 |
| 504.68539 | 0.252 |
| 504.9079 | 0.256 |
| 505.1304 | 0.257 |
| 505.35294 | 0.261 |
| 505.57547 | 0.264 |
| 505.798 | 0.269 |
| 506.02054 | 0.269 |
| 506.2431 | 0.274 |
| 506.46567 | 0.275 |
| 506.68823 | 0.28 |
| 506.91083 | 0.281 |
| 507.13342 | 0.285 |
| 507.35602 | 0.287 |
| 507.57864 | 0.293 |
| 507.80127 | 0.295 |
| 508.02393 | 0.297 |
| 508.24655 | 0.299 |
| 508.46921 | 0.303 |
| 508.69189 | 0.306 |
| 508.91455 | 0.31 |
| 509.13724 | 0.311 |
| 509.35995 | 0.316 |
| 509.58264 | 0.318 |
| 509.80536 | 0.321 |
| 510.02811 | 0.324 |
| 510.25082 | 0.328 |
| 510.47357 | 0.33 |
| 510.69632 | 0.332 |
| 510.9191 | 0.334 |
| 511.14188 | 0.337 |
| 511.36465 | 0.336 |
| 511.58746 | 0.341 |
| 511.81027 | 0.342 |
| 512.03308 | 0.346 |
| 512.25592 | 0.348 |
| 512.47876 | 0.351 |
| 512.7016 | 0.354 |
| 512.92444 | 0.356 |
| 513.14734 | 0.358 |
| 513.37018 | 0.36 |
| 513.59308 | 0.362 |
| 513.81598 | 0.365 |
| 514.03888 | 0.367 |
| 514.26178 | 0.37 |
| 514.48474 | 0.37 |
| 514.70764 | 0.373 |
| 514.9306 | 0.375 |
| 515.15356 | 0.378 |
| 515.37653 | 0.379 |
| 515.59949 | 0.381 |
| 515.82251 | 0.382 |
| 516.04547 | 0.385 |
| 516.26849 | 0.387 |
| 516.49152 | 0.388 |
| 516.71454 | 0.39 |
| 516.93756 | 0.394 |
| 517.16058 | 0.395 |
| 517.38367 | 0.398 |
| 517.60675 | 0.397 |
| 517.82977 | 0.402 |
| 518.05286 | 0.403 |
| 518.276 | 0.406 |
| 518.49908 | 0.41 |
| 518.72223 | 0.411 |
| 518.94531 | 0.414 |
| 519.16846 | 0.417 |
| 519.3916 | 0.418 |
| 519.61475 | 0.422 |
| 519.83795 | 0.424 |
| 520.0611 | 0.429 |
| 520.2843 | 0.429 |
| 520.50751 | 0.435 |
| 520.73071 | 0.438 |
| 520.95392 | 0.438 |
| 521.17712 | 0.44 |
| 521.40033 | 0.441 |
| 521.6236 | 0.442 |
| 521.84686 | 0.441 |
| 522.07013 | 0.448 |
| 522.2934 | 0.451 |
| 522.51666 | 0.454 |
| 522.73999 | 0.456 |
| 522.96326 | 0.46 |
| 523.18658 | 0.461 |
| 523.40991 | 0.465 |
| 523.63324 | 0.466 |
| 523.85657 | 0.47 |
| 524.07996 | 0.471 |
| 524.30328 | 0.474 |
| 524.52667 | 0.476 |
| 524.75006 | 0.477 |
| 524.97345 | 0.479 |
| 525.19684 | 0.481 |
| 525.42029 | 0.482 |
| 525.64368 | 0.485 |
| 525.86713 | 0.484 |
| 526.09058 | 0.486 |
| 526.31403 | 0.483 |
| 526.53748 | 0.485 |
| 526.76099 | 0.486 |
| 526.98444 | 0.49 |
| 527.20795 | 0.492 |
| 527.43146 | 0.495 |
| 527.65497 | 0.497 |
| 527.87848 | 0.498 |
| 528.10199 | 0.499 |
| 528.32556 | 0.5 |
| 528.54913 | 0.501 |
| 528.77264 | 0.503 |
| 528.99622 | 0.502 |
| 529.21985 | 0.507 |
| 529.44342 | 0.505 |
| 529.66699 | 0.508 |
| 529.89063 | 0.506 |
| 530.11426 | 0.508 |
| 530.33789 | 0.51 |
| 530.56152 | 0.511 |
| 530.78516 | 0.512 |
| 531.00885 | 0.514 |
| 531.23248 | 0.514 |
| 531.45618 | 0.516 |
| 531.67987 | 0.514 |
| 531.90356 | 0.515 |
| 532.12732 | 0.515 |
| 532.35101 | 0.517 |
| 532.57477 | 0.514 |
| 532.79852 | 0.516 |
| 533.02222 | 0.516 |
| 533.24603 | 0.518 |
| 533.46979 | 0.516 |
| 533.69354 | 0.518 |
| 533.91736 | 0.516 |
| 534.14117 | 0.518 |
| 534.36493 | 0.517 |
| 534.58881 | 0.518 |
| 534.81262 | 0.518 |
| 535.03644 | 0.519 |
| 535.26031 | 0.517 |
| 535.48413 | 0.52 |
| 535.70801 | 0.52 |
| 535.93188 | 0.521 |
| 536.15582 | 0.52 |
| 536.3797 | 0.522 |
| 536.60364 | 0.521 |
| 536.82751 | 0.523 |
| 537.05145 | 0.522 |
| 537.27539 | 0.523 |
| 537.49933 | 0.523 |
| 537.72333 | 0.524 |
| 537.94727 | 0.523 |
| 538.17126 | 0.526 |
| 538.39526 | 0.526 |
| 538.61926 | 0.528 |
| 538.84326 | 0.525 |
| 539.06726 | 0.527 |
| 539.29132 | 0.528 |
| 539.51532 | 0.531 |
| 539.73938 | 0.53 |
| 539.96344 | 0.531 |
| 540.1875 | 0.533 |
| 540.41162 | 0.532 |
| 540.63568 | 0.534 |
| 540.8598 | 0.532 |
| 541.08386 | 0.535 |
| 541.30798 | 0.536 |
| 541.5321 | 0.536 |
| 541.75629 | 0.535 |
| 541.98041 | 0.536 |
| 542.20459 | 0.537 |
| 542.42877 | 0.536 |
| 542.65289 | 0.538 |
| 542.87714 | 0.536 |
| 543.10132 | 0.537 |
| 543.3255 | 0.536 |
| 543.54974 | 0.538 |
| 543.77393 | 0.539 |
| 543.99817 | 0.54 |
| 544.22241 | 0.539 |
| 544.44672 | 0.542 |
| 544.67096 | 0.539 |
| 544.89526 | 0.541 |
| 545.11951 | 0.539 |
| 545.34381 | 0.542 |
| 545.56812 | 0.543 |
| 545.79242 | 0.542 |
| 546.01678 | 0.543 |
| 546.24109 | 0.545 |
| 546.46545 | 0.542 |
| 546.68982 | 0.544 |
| 546.91418 | 0.541 |
| 547.13855 | 0.543 |
| 547.36292 | 0.544 |
| 547.58734 | 0.546 |
| 547.81171 | 0.542 |
| 548.03613 | 0.542 |
| 548.26056 | 0.539 |
| 548.48499 | 0.54 |
| 548.70947 | 0.537 |
| 548.9339 | 0.538 |
| 549.15839 | 0.539 |
| 549.38287 | 0.541 |
| 549.6073 | 0.539 |
| 549.83185 | 0.541 |
| 550.05634 | 0.538 |
| 550.28082 | 0.542 |
| 550.50537 | 0.54 |
| 550.72992 | 0.541 |
| 550.95447 | 0.54 |
| 551.17902 | 0.54 |
| 551.40356 | 0.539 |
| 551.62811 | 0.541 |
| 551.85272 | 0.541 |
| 552.07733 | 0.542 |
| 552.30188 | 0.542 |
| 552.52655 | 0.542 |
| 552.75116 | 0.541 |
| 552.97577 | 0.543 |
| 553.20044 | 0.539 |
| 553.42505 | 0.543 |
| 553.64972 | 0.54 |
| 553.87439 | 0.543 |
| 554.09906 | 0.542 |
| 554.32379 | 0.545 |
| 554.54846 | 0.544 |
| 554.77319 | 0.546 |
| 554.99792 | 0.544 |
| 555.22266 | 0.547 |
| 555.44739 | 0.545 |
| 555.67212 | 0.546 |
| 555.89691 | 0.547 |
| 556.12164 | 0.546 |
| 556.34644 | 0.546 |
| 556.57123 | 0.548 |
| 556.79602 | 0.546 |
| 557.02087 | 0.548 |
| 557.24567 | 0.547 |
| 557.47052 | 0.548 |
| 557.69531 | 0.548 |
| 557.92017 | 0.55 |
| 558.14502 | 0.549 |
| 558.36993 | 0.549 |
| 558.59479 | 0.546 |
| 558.8197 | 0.547 |
| 559.04462 | 0.544 |
| 559.26947 | 0.546 |
| 559.49438 | 0.543 |
| 559.71936 | 0.547 |
| 559.94427 | 0.544 |
| 560.16925 | 0.546 |
| 560.39417 | 0.545 |
| 560.61914 | 0.545 |
| 560.84412 | 0.545 |
| 561.06915 | 0.545 |
| 561.29413 | 0.543 |
| 561.5191 | 0.545 |
| 561.74414 | 0.544 |
| 561.96918 | 0.545 |
| 562.19421 | 0.543 |
| 562.41925 | 0.545 |
| 562.64429 | 0.543 |
| 562.86938 | 0.545 |
| 563.09448 | 0.542 |
| 563.31952 | 0.542 |
| 563.54462 | 0.543 |
| 563.76978 | 0.545 |
| 563.99487 | 0.542 |
| 564.21997 | 0.544 |
| 564.44513 | 0.543 |
| 564.67029 | 0.545 |
| 564.89545 | 0.542 |
| 565.12061 | 0.544 |
| 565.34576 | 0.542 |
| 565.57092 | 0.544 |
| 565.79614 | 0.543 |
| 566.02136 | 0.546 |
| 566.24658 | 0.544 |
| 566.4718 | 0.545 |
| 566.69702 | 0.543 |
| 566.92224 | 0.545 |
| 567.14752 | 0.545 |
| 567.3728 | 0.545 |
| 567.59808 | 0.544 |
| 567.82336 | 0.545 |
| 568.04864 | 0.543 |
| 568.27393 | 0.544 |
| 568.49927 | 0.543 |
| 568.72455 | 0.543 |
| 568.94989 | 0.542 |
| 569.17523 | 0.542 |
| 569.40063 | 0.54 |
| 569.62598 | 0.541 |
| 569.85132 | 0.539 |
| 570.07672 | 0.538 |
| 570.30212 | 0.536 |
| 570.52753 | 0.539 |
| 570.75293 | 0.534 |
| 570.97833 | 0.538 |
| 571.2038 | 0.534 |
| 571.4292 | 0.535 |
| 571.65466 | 0.532 |
| 571.88013 | 0.533 |
| 572.10559 | 0.53 |
| 572.33112 | 0.53 |
| 572.55658 | 0.526 |
| 572.7821 | 0.528 |
| 573.00757 | 0.526 |
| 573.23309 | 0.527 |
| 573.45862 | 0.523 |
| 573.6842 | 0.525 |
| 573.90973 | 0.522 |
| 574.13531 | 0.522 |
| 574.36084 | 0.52 |
| 574.58643 | 0.521 |
| 574.81201 | 0.519 |
| 575.0376 | 0.52 |
| 575.26324 | 0.517 |
| 575.48883 | 0.519 |
| 575.71448 | 0.515 |
| 575.94012 | 0.516 |
| 576.16577 | 0.514 |
| 576.39142 | 0.515 |
| 576.61707 | 0.511 |
| 576.84277 | 0.512 |
| 577.06848 | 0.509 |
| 577.29413 | 0.511 |
| 577.51984 | 0.509 |
| 577.74554 | 0.507 |
| 577.97131 | 0.506 |
| 578.19702 | 0.507 |
| 578.42279 | 0.506 |
| 578.64856 | 0.503 |
| 578.87433 | 0.504 |
| 579.1001 | 0.501 |
| 579.32587 | 0.504 |
| 579.55164 | 0.502 |
| 579.77747 | 0.502 |
| 580.0033 | 0.497 |
| 580.22913 | 0.501 |
| 580.45496 | 0.498 |
| 580.68079 | 0.5 |
| 580.90662 | 0.498 |
| 581.13251 | 0.5 |
| 581.3584 | 0.496 |
| 581.58429 | 0.497 |
| 581.81018 | 0.495 |
| 582.03607 | 0.497 |
| 582.26196 | 0.494 |
| 582.48792 | 0.494 |
| 582.71381 | 0.493 |
| 582.93976 | 0.494 |
| 583.16571 | 0.492 |
| 583.39166 | 0.492 |
| 583.61768 | 0.489 |
| 583.84363 | 0.49 |
| 584.06964 | 0.489 |
| 584.29565 | 0.488 |
| 584.52167 | 0.486 |
| 584.74768 | 0.487 |
| 584.97369 | 0.484 |
| 585.19977 | 0.486 |
| 585.42578 | 0.482 |
| 585.65186 | 0.483 |
| 585.87793 | 0.48 |
| 586.104 | 0.482 |
| 586.33008 | 0.478 |
| 586.55621 | 0.481 |
| 586.78229 | 0.477 |
| 587.00842 | 0.478 |
| 587.23456 | 0.478 |
| 587.46069 | 0.476 |
| 587.68683 | 0.476 |
| 587.91302 | 0.476 |
| 588.13916 | 0.474 |
| 588.36536 | 0.474 |
| 588.59155 | 0.471 |
| 588.81775 | 0.471 |
| 589.04395 | 0.469 |
| 589.27014 | 0.47 |
| 589.4964 | 0.467 |
| 589.7226 | 0.469 |
| 589.94885 | 0.466 |
| 590.17511 | 0.467 |
| 590.40137 | 0.465 |
| 590.62769 | 0.465 |
| 590.85394 | 0.463 |
| 591.08026 | 0.462 |
| 591.30658 | 0.46 |
| 591.5329 | 0.461 |
| 591.75922 | 0.457 |
| 591.98553 | 0.458 |
| 592.21185 | 0.456 |
| 592.43823 | 0.456 |
| 592.66461 | 0.453 |
| 592.89099 | 0.454 |
| 593.11737 | 0.452 |
| 593.34375 | 0.451 |
| 593.57013 | 0.449 |
| 593.79657 | 0.45 |
| 594.02301 | 0.448 |
| 594.24945 | 0.449 |
| 594.47589 | 0.445 |
| 594.70233 | 0.446 |
| 594.92877 | 0.442 |
| 595.15527 | 0.445 |
| 595.38171 | 0.441 |
| 595.60822 | 0.442 |
| 595.83472 | 0.44 |
| 596.06122 | 0.437 |
| 596.28778 | 0.437 |
| 596.51428 | 0.439 |
| 596.74084 | 0.437 |
| 596.96741 | 0.437 |
| 597.19397 | 0.434 |
| 597.42053 | 0.435 |
| 597.64709 | 0.433 |
| 597.87372 | 0.434 |
| 598.10028 | 0.43 |
| 598.3269 | 0.429 |
| 598.55353 | 0.43 |
| 598.78015 | 0.429 |
| 599.00677 | 0.427 |
| 599.23346 | 0.427 |
| 599.46008 | 0.425 |
| 599.68677 | 0.426 |
| 599.91345 | 0.424 |
| 600.14014 | 0.424 |
| 600.36682 | 0.421 |
| 600.59351 | 0.421 |
| 600.82025 | 0.419 |
| 601.047 | 0.418 |
| 601.27374 | 0.416 |
| 601.50049 | 0.418 |
| 601.72723 | 0.415 |
| 601.95398 | 0.414 |
| 602.18079 | 0.412 |
| 602.40753 | 0.413 |
| 602.63434 | 0.41 |
| 602.86114 | 0.41 |
| 603.08795 | 0.407 |
| 603.31482 | 0.408 |
| 603.54163 | 0.405 |
| 603.76849 | 0.405 |
| 603.9953 | 0.403 |
| 604.22217 | 0.403 |
| 604.44904 | 0.399 |
| 604.67596 | 0.4 |
| 604.90283 | 0.399 |
| 605.12976 | 0.399 |
| 605.35663 | 0.396 |
| 605.58356 | 0.395 |
| 605.81049 | 0.393 |
| 606.03748 | 0.393 |
| 606.2644 | 0.39 |
| 606.49139 | 0.392 |
| 606.71832 | 0.389 |
| 606.94531 | 0.389 |
| 607.1723 | 0.386 |
| 607.39929 | 0.387 |
| 607.62634 | 0.385 |
| 607.85333 | 0.384 |
| 608.08038 | 0.381 |
| 608.30743 | 0.382 |
| 608.53448 | 0.378 |
| 608.76154 | 0.379 |
| 608.98859 | 0.375 |
| 609.2157 | 0.376 |
| 609.44275 | 0.373 |
| 609.66986 | 0.374 |
| 609.89697 | 0.369 |
| 610.12408 | 0.371 |
| 610.3512 | 0.369 |
| 610.57837 | 0.369 |
| 610.80548 | 0.366 |
| 611.03265 | 0.366 |
| 611.25983 | 0.363 |
| 611.487 | 0.364 |
| 611.71417 | 0.361 |
| 611.94141 | 0.361 |
| 612.16858 | 0.359 |
| 612.39581 | 0.36 |
| 612.62305 | 0.355 |
| 612.85028 | 0.356 |
| 613.07751 | 0.353 |
| 613.30475 | 0.355 |
| 613.53204 | 0.351 |
| 613.75928 | 0.352 |
| 613.98657 | 0.349 |
| 614.21387 | 0.347 |
| 614.44116 | 0.344 |
| 614.66852 | 0.346 |
| 614.89581 | 0.343 |
| 615.12317 | 0.343 |
| 615.35052 | 0.341 |
| 615.57782 | 0.341 |
| 615.80524 | 0.339 |
| 616.03259 | 0.339 |
| 616.25995 | 0.336 |
| 616.48737 | 0.336 |
| 616.71478 | 0.333 |
| 616.94214 | 0.333 |
| 617.16962 | 0.331 |
| 617.39703 | 0.332 |
| 617.62445 | 0.329 |
| 617.85193 | 0.329 |
| 618.07935 | 0.324 |
| 618.30682 | 0.326 |
| 618.5343 | 0.324 |
| 618.76178 | 0.323 |
| 618.98932 | 0.32 |
| 619.2168 | 0.319 |
| 619.44434 | 0.32 |
| 619.67188 | 0.319 |
| 619.89941 | 0.316 |
| 620.12695 | 0.315 |
| 620.35449 | 0.312 |
| 620.58209 | 0.313 |
| 620.80963 | 0.31 |
| 621.03723 | 0.31 |
| 621.26483 | 0.309 |
| 621.49243 | 0.308 |
| 621.72003 | 0.306 |
| 621.94769 | 0.305 |
| 622.17529 | 0.303 |
| 622.40295 | 0.303 |
| 622.63062 | 0.3 |
| 622.85828 | 0.301 |
| 623.08594 | 0.298 |
| 623.31366 | 0.298 |
| 623.54132 | 0.295 |
| 623.76904 | 0.295 |
| 623.99677 | 0.293 |
| 624.22449 | 0.294 |
| 624.45221 | 0.293 |
| 624.67993 | 0.292 |
| 624.90771 | 0.288 |
| 625.13544 | 0.288 |
| 625.36322 | 0.286 |
| 625.591 | 0.286 |
| 625.81879 | 0.283 |
| 626.04663 | 0.284 |
| 626.27441 | 0.282 |
| 626.50226 | 0.281 |
| 626.73004 | 0.279 |
| 626.95789 | 0.279 |
| 627.18573 | 0.276 |
| 627.41364 | 0.276 |
| 627.64148 | 0.274 |
| 627.86938 | 0.274 |
| 628.09723 | 0.272 |
| 628.32513 | 0.272 |
| 628.55304 | 0.27 |
| 628.78094 | 0.269 |
| 629.00891 | 0.267 |
| 629.23682 | 0.267 |
| 629.46478 | 0.265 |
| 629.69275 | 0.264 |
| 629.92072 | 0.262 |
| 630.14868 | 0.263 |
| 630.37665 | 0.26 |
| 630.60468 | 0.26 |
| 630.83264 | 0.258 |
| 631.06067 | 0.257 |
| 631.2887 | 0.255 |
| 631.51672 | 0.255 |
| 631.74481 | 0.253 |
| 631.97284 | 0.253 |
| 632.20093 | 0.251 |
| 632.42896 | 0.251 |
| 632.65704 | 0.248 |
| 632.88513 | 0.249 |
| 633.11328 | 0.246 |
| 633.34137 | 0.245 |
| 633.56946 | 0.243 |
| 633.79761 | 0.243 |
| 634.02576 | 0.241 |
| 634.25391 | 0.242 |
| 634.48206 | 0.238 |
| 634.71027 | 0.238 |
| 634.93842 | 0.237 |
| 635.16663 | 0.236 |
| 635.39484 | 0.233 |
| 635.62305 | 0.233 |
| 635.85126 | 0.231 |
| 636.07947 | 0.232 |
| 636.30768 | 0.228 |
| 636.53595 | 0.226 |
| 636.76422 | 0.227 |
| 636.99249 | 0.223 |
| 637.22076 | 0.224 |
| 637.44904 | 0.222 |
| 637.67737 | 0.222 |
| 637.90564 | 0.22 |
| 638.13397 | 0.219 |
| 638.3623 | 0.217 |
| 638.59064 | 0.218 |
| 638.81897 | 0.216 |
| 639.0473 | 0.216 |
| 639.2757 | 0.213 |
| 639.50409 | 0.214 |
| 639.73242 | 0.213 |
| 639.96082 | 0.213 |
| 640.18927 | 0.209 |
| 640.41766 | 0.211 |
| 640.64606 | 0.208 |
| 640.87451 | 0.209 |
| 641.10297 | 0.206 |
| 641.33142 | 0.204 |
| 641.55988 | 0.204 |
| 641.78833 | 0.204 |
| 642.01685 | 0.201 |
| 642.2453 | 0.201 |
| 642.47382 | 0.199 |
| 642.70233 | 0.198 |
| 642.93085 | 0.197 |
| 643.15936 | 0.197 |
| 643.38794 | 0.192 |
| 643.61646 | 0.193 |
| 643.84503 | 0.194 |
| 644.07361 | 0.195 |
| 644.30219 | 0.192 |
| 644.53076 | 0.19 |
| 644.75934 | 0.188 |
| 644.98798 | 0.189 |
| 645.21655 | 0.187 |
| 645.44519 | 0.187 |
| 645.67383 | 0.186 |
| 645.90247 | 0.186 |
| 646.13116 | 0.185 |
| 646.3598 | 0.185 |
| 646.5885 | 0.181 |
| 646.81714 | 0.179 |
| 647.04584 | 0.18 |
| 647.27454 | 0.18 |
| 647.5033 | 0.177 |
| 647.73199 | 0.178 |
| 647.96075 | 0.178 |
| 648.18945 | 0.177 |
| 648.41821 | 0.178 |
| 648.64697 | 0.173 |
| 648.87579 | 0.173 |
| 649.10455 | 0.173 |
| 649.33331 | 0.172 |
| 649.56213 | 0.171 |
| 649.79095 | 0.166 |
| 650.01978 | 0.17 |
| 650.2486 | 0.169 |
| 650.47742 | 0.17 |
| 650.7063 | 0.168 |
| 650.93518 | 0.168 |
| 651.164 | 0.167 |
| 651.39288 | 0.164 |
| 651.62177 | 0.162 |
| 651.85071 | 0.165 |
| 652.07959 | 0.16 |
| 652.30853 | 0.16 |
| 652.53741 | 0.155 |
| 652.76636 | 0.16 |
| 652.9953 | 0.158 |
| 653.2243 | 0.159 |
| 653.45325 | 0.156 |
| 653.68219 | 0.155 |
| 653.91119 | 0.155 |
| 654.1402 | 0.153 |
| 654.3692 | 0.152 |
| 654.59821 | 0.154 |
| 654.82727 | 0.15 |
| 655.05627 | 0.15 |
| 655.28534 | 0.148 |
| 655.51434 | 0.149 |
| 655.74341 | 0.146 |
| 655.97253 | 0.145 |
| 656.2016 | 0.144 |
| 656.43066 | 0.145 |
| 656.65979 | 0.142 |
| 656.88892 | 0.142 |
| 657.11804 | 0.143 |
| 657.34717 | 0.144 |
| 657.57629 | 0.14 |
| 657.80542 | 0.141 |
| 658.03461 | 0.14 |
| 658.26373 | 0.139 |
| 658.49292 | 0.137 |
| 658.72211 | 0.137 |
| 658.95136 | 0.136 |
| 659.18054 | 0.136 |
| 659.40973 | 0.134 |
| 659.63898 | 0.134 |
| 659.86823 | 0.132 |
| 660.09747 | 0.132 |
| 660.32672 | 0.13 |
| 660.55597 | 0.131 |
| 660.78528 | 0.128 |
| 661.01453 | 0.128 |
| 661.24384 | 0.128 |
| 661.47314 | 0.128 |
| 661.70245 | 0.126 |
| 661.93176 | 0.126 |
| 662.16113 | 0.125 |
| 662.39044 | 0.125 |
| 662.61981 | 0.123 |
| 662.84918 | 0.124 |
| 663.07855 | 0.123 |
| 663.30792 | 0.123 |
| 663.53729 | 0.121 |
| 663.76672 | 0.121 |
| 663.99615 | 0.12 |
| 664.22552 | 0.12 |
| 664.45496 | 0.118 |
| 664.68439 | 0.119 |
| 664.91388 | 0.117 |
| 665.14331 | 0.117 |
| 665.3728 | 0.114 |
| 665.60229 | 0.115 |
| 665.83179 | 0.114 |
| 666.06128 | 0.115 |
| 666.29077 | 0.112 |
| 666.52026 | 0.114 |
| 666.74982 | 0.111 |
| 666.97937 | 0.112 |
| 667.20886 | 0.109 |
| 667.43842 | 0.109 |
| 667.66803 | 0.109 |
| 667.89758 | 0.107 |
| 668.1272 | 0.106 |
| 668.35675 | 0.108 |
| 668.58636 | 0.107 |
| 668.81598 | 0.106 |
| 669.04559 | 0.104 |
| 669.27521 | 0.105 |
| 669.50488 | 0.103 |
| 669.73456 | 0.104 |
| 669.96417 | 0.102 |
| 670.19385 | 0.103 |
| 670.42352 | 0.101 |
| 670.65326 | 0.101 |
| 670.88293 | 0.099 |
| 671.11267 | 0.1 |
| 671.34235 | 0.099 |
| 671.57208 | 0.099 |
| 671.80182 | 0.098 |
| 672.03156 | 0.096 |
| 672.26135 | 0.096 |
| 672.49109 | 0.097 |
| 672.72089 | 0.095 |
| 672.95068 | 0.095 |
| 673.18048 | 0.095 |
| 673.41028 | 0.095 |
| 673.64008 | 0.093 |
| 673.86993 | 0.092 |
| 674.09973 | 0.092 |
| 674.32959 | 0.092 |
| 674.55945 | 0.09 |
| 674.78931 | 0.09 |
| 675.01917 | 0.089 |
| 675.24908 | 0.09 |
| 675.47894 | 0.087 |
| 675.70886 | 0.089 |
| 675.93878 | 0.088 |
| 676.1687 | 0.088 |
| 676.39862 | 0.087 |
| 676.6286 | 0.086 |
| 676.85852 | 0.085 |
| 677.0885 | 0.086 |
| 677.31848 | 0.084 |
| 677.54846 | 0.084 |
| 677.77844 | 0.083 |
| 678.00842 | 0.084 |
| 678.2384 | 0.083 |
| 678.46844 | 0.083 |
| 678.69849 | 0.082 |
| 678.92853 | 0.081 |
| 679.15857 | 0.08 |
| 679.38861 | 0.081 |
| 679.61871 | 0.08 |
| 679.84875 | 0.08 |
| 680.07886 | 0.078 |
| 680.30896 | 0.079 |
| 680.53906 | 0.077 |
| 680.76917 | 0.077 |
| 680.99927 | 0.077 |
| 681.22943 | 0.077 |
| 681.45959 | 0.076 |
| 681.6897 | 0.076 |
| 681.91986 | 0.075 |
| 682.15002 | 0.075 |
| 682.38025 | 0.073 |
| 682.61041 | 0.075 |
| 682.84064 | 0.073 |
| 683.07086 | 0.073 |
| 683.30109 | 0.073 |
| 683.53131 | 0.072 |
| 683.76154 | 0.069 |
| 683.99176 | 0.072 |
| 684.22205 | 0.07 |
| 684.45233 | 0.071 |
| 684.68256 | 0.07 |
| 684.9129 | 0.07 |
| 685.14319 | 0.07 |
| 685.37347 | 0.068 |
| 685.60382 | 0.069 |
| 685.83411 | 0.069 |
| 686.06445 | 0.066 |
| 686.2948 | 0.068 |
| 686.52515 | 0.066 |
| 686.75549 | 0.066 |
| 686.9859 | 0.064 |
| 687.21631 | 0.066 |
| 687.44666 | 0.064 |
| 687.67706 | 0.065 |
| 687.90747 | 0.063 |
| 688.13794 | 0.064 |
| 688.36835 | 0.063 |
| 688.59875 | 0.063 |
| 688.82922 | 0.062 |
| 689.05969 | 0.062 |
| 689.29016 | 0.061 |
| 689.52063 | 0.061 |
| 689.75116 | 0.059 |
| 689.98163 | 0.061 |
| 690.21216 | 0.059 |
| 690.44269 | 0.06 |
| 690.67322 | 0.058 |
| 690.90375 | 0.06 |
| 691.13428 | 0.058 |
| 691.36481 | 0.058 |
| 691.5954 | 0.058 |
| 691.82599 | 0.057 |
| 692.05658 | 0.057 |
| 692.28717 | 0.057 |
| 692.51776 | 0.056 |
| 692.74835 | 0.057 |
| 692.979 | 0.054 |
| 693.20966 | 0.055 |
| 693.44031 | 0.054 |
| 693.67096 | 0.055 |
| 693.90161 | 0.054 |
| 694.13226 | 0.054 |
| 694.36298 | 0.053 |
| 694.59363 | 0.053 |
| 694.82434 | 0.053 |
| 695.05505 | 0.052 |
| 695.28577 | 0.053 |
| 695.51648 | 0.051 |
| 695.74725 | 0.051 |
| 695.97797 | 0.05 |
| 696.20874 | 0.052 |
| 696.43951 | 0.049 |
| 696.67029 | 0.049 |
| 696.90106 | 0.049 |
| 697.1319 | 0.049 |
| 697.36267 | 0.048 |
| 697.59351 | 0.049 |
| 697.82434 | 0.048 |
| 698.05518 | 0.048 |
| 698.28601 | 0.048 |
| 698.51685 | 0.048 |
| 698.74774 | 0.047 |
| 698.97858 | 0.047 |
| 699.20947 | 0.045 |
| 699.44037 | 0.047 |
| 699.67126 | 0.045 |
| 699.90216 | 0.045 |
| 700.13312 | 0.044 |
| 700.36401 | 0.046 |
| 700.59497 | 0.043 |
| 700.82593 | 0.045 |
| 701.05688 | 0.044 |
| 701.28784 | 0.044 |
| 701.51886 | 0.043 |
| 701.74982 | 0.044 |
| 701.98083 | 0.042 |
| 702.21185 | 0.043 |
| 702.44287 | 0.041 |
| 702.67389 | 0.043 |
| 702.90491 | 0.042 |
| 703.13599 | 0.042 |
| 703.367 | 0.041 |
| 703.59808 | 0.041 |
| 703.82916 | 0.041 |
| 704.06024 | 0.041 |
| 704.29132 | 0.039 |
| 704.52246 | 0.041 |
| 704.75354 | 0.039 |
| 704.98468 | 0.04 |
| 705.21582 | 0.039 |
| 705.44696 | 0.04 |
| 705.6781 | 0.038 |
| 705.90924 | 0.039 |
| 706.14044 | 0.038 |
| 706.37164 | 0.038 |
| 706.60278 | 0.036 |
| 706.83398 | 0.037 |
| 707.06525 | 0.038 |
| 707.29645 | 0.037 |
| 707.52765 | 0.037 |
| 707.75891 | 0.037 |
| 707.99017 | 0.036 |
| 708.22144 | 0.036 |
| 708.4527 | 0.035 |
| 708.68396 | 0.036 |
| 708.91522 | 0.034 |
| 709.14655 | 0.036 |
| 709.37781 | 0.034 |
| 709.60913 | 0.035 |
| 709.84045 | 0.035 |
| 710.07184 | 0.035 |
| 710.30316 | 0.033 |
| 710.53448 | 0.034 |
| 710.76587 | 0.033 |
| 710.99725 | 0.033 |
| 711.22864 | 0.033 |
| 711.46002 | 0.033 |
| 711.69141 | 0.031 |
| 711.92285 | 0.033 |
| 712.15424 | 0.031 |
| 712.38568 | 0.032 |
| 712.61713 | 0.033 |
| 712.84857 | 0.032 |
| 713.08002 | 0.031 |
| 713.31146 | 0.03 |
| 713.54297 | 0.03 |
| 713.77448 | 0.03 |
| 714.00592 | 0.03 |
| 714.23743 | 0.03 |
| 714.46893 | 0.031 |
| 714.7005 | 0.03 |
| 714.93201 | 0.028 |
| 715.16357 | 0.03 |
| 715.39514 | 0.028 |
| 715.62671 | 0.029 |
| 715.85828 | 0.03 |
| 716.08984 | 0.028 |
| 716.32141 | 0.029 |
| 716.55304 | 0.029 |
| 716.78467 | 0.027 |
| 717.01624 | 0.028 |
| 717.24786 | 0.027 |
| 717.47955 | 0.028 |
| 717.71118 | 0.027 |
| 717.94281 | 0.026 |
| 718.1745 | 0.027 |
| 718.40619 | 0.027 |
| 718.63788 | 0.026 |
| 718.86957 | 0.027 |
| 719.10126 | 0.026 |
| 719.33301 | 0.026 |
| 719.5647 | 0.026 |
| 719.79645 | 0.027 |
| 720.0282 | 0.025 |
| 720.25995 | 0.027 |
| 720.4917 | 0.025 |
| 720.72351 | 0.027 |
| 720.95526 | 0.024 |
| 721.18707 | 0.027 |
| 721.41888 | 0.025 |
| 721.6507 | 0.026 |
| 721.88251 | 0.025 |
| 722.11432 | 0.025 |
| 722.34619 | 0.023 |
| 722.578 | 0.025 |
| 722.80988 | 0.023 |
| 723.04175 | 0.024 |
| 723.27362 | 0.023 |
| 723.50549 | 0.023 |
| 723.73743 | 0.024 |
| 723.9693 | 0.023 |
| 724.20123 | 0.022 |
| 724.43317 | 0.023 |
| 724.6651 | 0.022 |
| 724.89703 | 0.022 |
| 725.12897 | 0.021 |
| 725.36096 | 0.021 |
| 725.59296 | 0.021 |
| 725.82489 | 0.024 |
| 726.05688 | 0.021 |
| 726.28888 | 0.021 |
| 726.52094 | 0.021 |
| 726.75293 | 0.022 |
| 726.98499 | 0.022 |
| 727.21704 | 0.021 |
| 727.44904 | 0.02 |
| 727.68115 | 0.021 |
| 727.91321 | 0.02 |
| 728.14526 | 0.02 |
| 728.37738 | 0.019 |
| 728.60944 | 0.02 |
| 728.84155 | 0.019 |
| 729.07367 | 0.019 |
| 729.30579 | 0.019 |
| 729.53796 | 0.021 |
| 729.77008 | 0.019 |
| 730.00226 | 0.02 |
| 730.23444 | 0.018 |
| 730.46655 | 0.02 |
| 730.69879 | 0.018 |
| 730.93097 | 0.019 |
| 731.16315 | 0.017 |
| 731.39539 | 0.019 |
| 731.62756 | 0.017 |
| 731.8598 | 0.019 |
| 732.09204 | 0.018 |
| 732.32434 | 0.02 |
| 732.55658 | 0.018 |
| 732.78882 | 0.019 |
| 733.02112 | 0.017 |
| 733.25342 | 0.017 |
| 733.48572 | 0.018 |
| 733.71802 | 0.019 |
| 733.95032 | 0.017 |
| 734.18268 | 0.017 |
| 734.41498 | 0.016 |
| 734.64734 | 0.018 |
| 734.8797 | 0.016 |
| 735.11206 | 0.017 |
| 735.34442 | 0.017 |
| 735.57684 | 0.018 |
| 735.8092 | 0.016 |
| 736.04163 | 0.017 |
| 736.27405 | 0.017 |
| 736.50647 | 0.016 |
| 736.73889 | 0.015 |
| 736.97131 | 0.017 |
| 737.20374 | 0.015 |
| 737.43622 | 0.018 |
| 737.6687 | 0.016 |
| 737.90118 | 0.016 |
| 738.13367 | 0.015 |
| 738.36615 | 0.022 |
| 738.59869 | 0.015 |
| 738.83118 | 0.015 |
| 739.06372 | 0.014 |
| 739.29626 | 0.015 |
| 739.52881 | 0.013 |
| 739.76135 | 0.015 |
| 739.9939 | 0.013 |
| 740.2265 | 0.015 |
| 740.45905 | 0.014 |
| 740.69165 | 0.015 |
| 740.92426 | 0.014 |
| 741.15686 | 0.014 |
| 741.38947 | 0.014 |
| 741.62213 | 0.015 |
| 741.85474 | 0.014 |
| 742.0874 | 0.014 |
| 742.32007 | 0.014 |
| 742.55273 | 0.015 |
| 742.7854 | 0.014 |
| 743.01813 | 0.014 |
| 743.25079 | 0.013 |
| 743.48352 | 0.014 |
| 743.71625 | 0.013 |
| 743.94897 | 0.014 |
| 744.1817 | 0.013 |
| 744.41443 | 0.013 |
| 744.64722 | 0.013 |
| 744.87994 | 0.015 |
| 745.11273 | 0.013 |
| 745.34552 | 0.014 |
| 745.57831 | 0.012 |
| 745.8111 | 0.013 |
| 746.04388 | 0.012 |
| 746.27673 | 0.013 |
| 746.50958 | 0.012 |
| 746.74243 | 0.014 |
| 746.97528 | 0.013 |
| 747.20813 | 0.014 |
| 747.44098 | 0.012 |
| 747.67383 | 0.011 |
| 747.90674 | 0.012 |
| 748.13965 | 0.013 |
| 748.37256 | 0.012 |
| 748.60547 | 0.012 |
| 748.83838 | 0.011 |
| 749.07135 | 0.011 |
| 749.30426 | 0.01 |
| 749.53723 | 0.012 |
| 749.7702 | 0.013 |
| 750.00317 | 0.013 |
| 750.23614 | 0.011 |
| 750.46912 | 0.011 |
| 750.70215 | 0.011 |
| 750.93512 | 0.012 |
| 751.16815 | 0.01 |
| 751.40118 | 0.012 |
| 751.63422 | 0.01 |
| 751.86731 | 0.011 |
| 752.10034 | 0.011 |
| 752.33344 | 0.011 |
| 752.56647 | 0.01 |
| 752.79956 | 0.011 |
| 753.03265 | 0.01 |
| 753.26575 | 0.011 |
| 753.4989 | 0.009 |
| 753.73199 | 0.01 |
| 753.96515 | 0.01 |
| 754.1983 | 0.01 |
| 754.43146 | 0.01 |
| 754.66461 | 0.009 |
| 754.89777 | 0.01 |
| 755.13098 | 0.01 |
| 755.36414 | 0.01 |
| 755.59735 | 0.01 |
| 755.83057 | 0.01 |
| 756.06378 | 0.009 |
| 756.297 | 0.01 |
| 756.53027 | 0.009 |
| 756.76349 | 0.01 |
| 756.99677 | 0.01 |
| 757.23004 | 0.009 |
| 757.46332 | 0.01 |
| 757.69659 | 0.01 |
| 757.92987 | 0.008 |
| 758.16321 | 0.01 |
| 758.39648 | 0.008 |
| 758.62982 | 0.009 |
| 758.86316 | 0.009 |
| 759.0965 | 0.01 |
| 759.32983 | 0.008 |
| 759.56323 | 0.01 |
| 759.79657 | 0.008 |
| 760.02997 | 0.009 |
| 760.26337 | 0.009 |
| 760.49677 | 0.009 |
| 760.73016 | 0.008 |
| 760.96356 | 0.009 |
| 761.19702 | 0.007 |
| 761.43042 | 0.008 |
| 761.66388 | 0.008 |
| 761.89734 | 0.009 |
| 762.1308 | 0.008 |
| 762.36426 | 0.008 |
| 762.59778 | 0.008 |
| 762.83124 | 0.008 |
| 763.06476 | 0.007 |
| 763.29828 | 0.008 |
| 763.5318 | 0.008 |
| 763.76532 | 0.009 |
| 763.9989 | 0.008 |
| 764.23242 | 0.008 |
| 764.466 | 0.008 |
| 764.69952 | 0.009 |
| 764.93311 | 0.008 |
| 765.16675 | 0.007 |
| 765.40033 | 0.009 |
| 765.63391 | 0.008 |
| 765.86755 | 0.008 |
| 766.1012 | 0.007 |
| 766.33478 | 0.007 |
| 766.56842 | 0.009 |
| 766.80212 | 0.007 |
| 767.03577 | 0.008 |
| 767.26947 | 0.008 |
| 767.50311 | 0.009 |
| 767.73682 | 0.007 |
| 767.97052 | 0.008 |
| 768.20422 | 0.007 |
| 768.43793 | 0.006 |
| 768.67169 | 0.007 |
| 768.9054 | 0.008 |
| 769.13916 | 0.007 |
| 769.37292 | 0.007 |
| 769.60669 | 0.007 |
| 769.84045 | 0.008 |
| 770.07428 | 0.007 |
| 770.30804 | 0.008 |
| 770.54187 | 0.006 |
| 770.7757 | 0.007 |
| 771.00952 | 0.006 |
| 771.24335 | 0.007 |
| 771.47717 | 0.006 |
| 771.71106 | 0.008 |
| 771.94489 | 0.006 |
| 772.17877 | 0.006 |
| 772.41266 | 0.007 |
| 772.64655 | 0.006 |
| 772.88043 | 0.008 |
| 773.11438 | 0.008 |
| 773.34827 | 0.006 |
| 773.58221 | 0.006 |
| 773.81616 | 0.006 |
| 774.05011 | 0.008 |
| 774.28406 | 0.006 |
| 774.51801 | 0.006 |
| 774.75201 | 0.007 |
| 774.98596 | 0.006 |
| 775.21997 | 0.006 |
| 775.45398 | 0.007 |
| 775.68799 | 0.005 |
| 775.922 | 0.005 |
| 776.15607 | 0.007 |
| 776.39008 | 0.008 |
| 776.62415 | 0.006 |
| 776.85822 | 0.007 |
| 777.09229 | 0.005 |
| 777.32636 | 0.007 |
| 777.56042 | 0.005 |
| 777.79456 | 0.006 |
| 778.02863 | 0.005 |
| 778.26276 | 0.005 |
| 778.49689 | 0.005 |
| 778.73102 | 0.005 |
| 778.96521 | 0.006 |
| 779.19934 | 0.007 |
| 779.43347 | 0.006 |
| 779.66766 | 0.005 |
| 779.90186 | 0.005 |
| 780.13605 | 0.006 |
| 780.37024 | 0.005 |
| 780.60449 | 0.006 |
| 780.83868 | 0.003 |
| 781.07294 | 0.006 |
| 781.30719 | 0.005 |
| 781.54138 | 0.006 |
| 781.7757 | 0.006 |
| 782.00995 | 0.005 |
| 782.2442 | 0.005 |
| 782.47852 | 0.005 |
| 782.71283 | 0.005 |
| 782.94708 | 0.006 |
| 783.1814 | 0.004 |
| 783.41577 | 0.005 |
| 783.65009 | 0.004 |
| 783.8844 | 0.005 |
| 784.11877 | 0.005 |
| 784.35315 | 0.006 |
| 784.58752 | 0.003 |
| 784.8219 | 0.006 |
| 785.05627 | 0.004 |
| 785.29071 | 0.005 |
| 785.52509 | 0.004 |
| 785.75952 | 0.005 |
| 785.99396 | 0.005 |
| 786.22839 | 0.005 |
| 786.46283 | 0.005 |
| 786.69727 | 0.005 |
| 786.93176 | 0.004 |
| 787.16626 | 0.005 |
| 787.4007 | 0.003 |
| 787.63519 | 0.005 |
| 787.86969 | 0.005 |
| 788.10425 | 0.006 |
| 788.33875 | 0.004 |
| 788.5733 | 0.006 |
| 788.8078 | 0.003 |
| 789.04236 | 0.005 |
| 789.27692 | 0.003 |
| 789.51154 | 0.004 |
| 789.74609 | 0.004 |
| 789.98065 | 0.004 |
| 790.21527 | 0.003 |
| 790.44989 | 0.004 |
| 790.68451 | 0.004 |
| 790.91913 | 0.004 |
| 791.15375 | 0.003 |
| 791.38843 | 0.005 |
| 791.62305 | 0.004 |
| 791.85773 | 0.006 |
| 792.09241 | 0.004 |
| 792.32709 | 0.006 |
| 792.56177 | 0.003 |
| 792.79651 | 0.004 |
| 793.03119 | 0.003 |
| 793.26593 | 0.004 |
| 793.50067 | 0.004 |
| 793.73541 | 0.006 |
| 793.97015 | 0.003 |
| 794.20489 | 0.004 |
| 794.43964 | 0.003 |
| 794.67444 | 0.005 |
| 794.90924 | 0.003 |
| 795.14404 | 0.004 |
| 795.37885 | 0.002 |
| 795.61365 | 0.005 |
| 795.84845 | 0.002 |
| 796.08331 | 0.005 |
| 796.31812 | 0.003 |
| 796.55298 | 0.004 |
| 796.78784 | 0.002 |
| 797.02271 | 0.005 |
| 797.25763 | 0.003 |
| 797.49249 | 0.006 |
| 797.72742 | 0.004 |
| 797.96228 | 0.004 |
| 798.1972 | 0.003 |
| 798.43213 | 0.004 |
| 798.66711 | 0.004 |
| 798.90204 | 0.004 |
| 799.13696 | 0.004 |
| 799.37195 | 0.005 |
| 799.60693 | 0.003 |
| 799.84192 | 0.004 |
| 800.0769 | 0.004 |
| 800.31189 | 0.003 |
| 800.54694 | 0.002 |
| 800.78192 | 0.004 |
| 801.01697 | 0.003 |
| 801.25201 | 0.003 |
| 801.48706 | 0.003 |
| 801.72211 | 0.004 |
| 801.95721 | 0.003 |
| 802.19226 | 0.004 |
| 802.42737 | 0.004 |
| 802.66248 | 0.005 |
| 802.89758 | 0.004 |
| 803.13269 | 0.004 |
| 803.3678 | 0.003 |
| 803.60291 | 0.004 |
| 803.83807 | 0.004 |
| 804.07324 | 0.005 |
| 804.30841 | 0.004 |
| 804.54358 | 0.003 |
| 804.77875 | 0.003 |
| 805.01392 | 0.002 |
| 805.24915 | 0.003 |
| 805.48431 | 0.005 |
| 805.71954 | 0.002 |
| 805.95477 | 0.002 |
| 806.19 | 0.002 |
| 806.42529 | 0.004 |
| 806.66052 | 0.003 |
| 806.89581 | 0.004 |
| 807.13104 | 0.002 |
| 807.36633 | 0.002 |
| 807.60162 | 0.003 |
| 807.83698 | 0.004 |
| 808.07227 | 0.002 |
| 808.30756 | 0.003 |
| 808.54291 | 0.004 |
| 808.77826 | 0.004 |
| 809.01361 | 0.003 |
| 809.24896 | 0.003 |
| 809.48431 | 0.003 |
| 809.71973 | 0.003 |
| 809.95508 | 0.003 |
| 810.19049 | 0.003 |
| 810.4259 | 0.002 |
| 810.66132 | 0.004 |
| 810.89673 | 0.002 |
| 811.1322 | 0.005 |
| 811.36761 | 0.003 |
| 811.60309 | 0.003 |
| 811.83856 | 0.002 |
| 812.07404 | 0.005 |
| 812.30951 | 0.003 |
| 812.54498 | 0.004 |
| 812.78046 | 0.002 |
| 813.01599 | 0.003 |
| 813.25153 | 0.003 |
| 813.48706 | 0.005 |
| 813.7226 | 0.002 |
| 813.95813 | 0.004 |
| 814.19366 | 0.002 |
| 814.42926 | 0.005 |
| 814.66479 | 0.003 |
| 814.90039 | 0 |
| 815.13599 | 0.003 |
| 815.37158 | 0.003 |
| 815.60724 | 0.004 |
| 815.84283 | 0.002 |
| 816.07849 | 0.004 |
| 816.31409 | 0 |
| 816.54974 | 0.002 |
| 816.7854 | 0.005 |
| 817.02106 | 0.005 |
| 817.25677 | 0.002 |
| 817.49243 | 0.003 |
| 817.72815 | 0.002 |
| 817.96387 | 0.002 |
| 818.19958 | 0.001 |
| 818.4353 | 0.003 |
| 818.67102 | 0.003 |
| 818.90674 | 0.003 |
| 819.14252 | 0.003 |
| 819.3783 | 0.003 |
| 819.61407 | 0.004 |
| 819.84985 | 0.003 |
| 820.08563 | 0.003 |
| 820.32141 | 0.005 |
| 820.55725 | 0.004 |
| 820.79303 | 0.003 |
| 821.02887 | 0.001 |
| 821.26471 | 0.003 |
| 821.50055 | 0.002 |
| 821.73639 | 0.002 |
| 821.97229 | 0.002 |
| 822.20813 | 0.003 |
| 822.44403 | 0.002 |
| 822.67993 | 0.004 |
| 822.91583 | 0.002 |
| 823.15173 | 0.004 |
| 823.3877 | 0.004 |
| 823.6236 | 0.002 |
| 823.85956 | 0.001 |
| 824.09546 | 0.003 |
| 824.33142 | 0.001 |
| 824.56738 | 0.002 |
| 824.80341 | 0.002 |
| 825.03937 | 0.001 |
| 825.27539 | 0 |
| 825.51135 | 0.002 |
| 825.74738 | 0.005 |
| 825.9834 | 0.003 |
| 826.21942 | 0.001 |
| 826.45551 | 0.004 |
| 826.69153 | 0.001 |
| 826.92761 | 0.003 |
| 827.1637 | 0.003 |
| 827.39978 | 0.006 |
| 827.63586 | 0.002 |
| 827.87195 | 0.003 |
| 828.10803 | 0.003 |
| 828.34418 | 0.003 |
| 828.58032 | 0.001 |
| 828.81641 | 0.005 |
| 829.05255 | 0.002 |
| 829.28876 | 0.004 |
| 829.5249 | 0.001 |
| 829.76105 | 0.003 |
| 829.99725 | 0.002 |
| 830.23346 | 0.003 |
| 830.46967 | 0 |
| 830.70587 | 0.004 |
| 830.94208 | 0.002 |
| 831.17828 | 0.005 |
| 831.41455 | 0.001 |
| 831.65082 | 0.001 |
| 831.88702 | 0 |
| 832.12329 | 0.003 |
| 832.35956 | 0.002 |
| 832.59589 | 0.003 |
| 832.83215 | 0.002 |
| 833.06848 | 0.004 |
| 833.30481 | 0.002 |
| 833.54114 | 0.003 |
| 833.77747 | 0.003 |
| 834.01379 | 0.001 |
| 834.25012 | 0.003 |
| 834.48651 | 0.003 |
| 834.72284 | 0.002 |
| 834.95923 | 0.004 |
| 835.19562 | 0 |
| 835.43201 | 0.003 |
| 835.66846 | 0.002 |
| 835.90485 | 0.004 |
| 836.1413 | 0 |
| 836.37769 | 0.002 |
| 836.61414 | 0.002 |
| 836.85059 | 0.003 |
| 837.08704 | 0.003 |
| 837.32355 | 0.003 |
| 837.56 | 0.003 |
| 837.79651 | 0.005 |
| 838.03302 | 0.002 |
| 838.26953 | 0.004 |
| 838.50604 | 0 |
| 838.74255 | 0.003 |
| 838.97913 | 0.002 |
| 839.21564 | 0.003 |
| 839.45221 | 0.001 |
| 839.68878 | 0.002 |
| 839.92535 | 0 |
| 840.16193 | 0.001 |
| 840.3985 | 0.003 |
| 840.63513 | 0.004 |
| 840.8717 | 0.002 |
| 841.10834 | 0.004 |
| 841.34497 | 0.003 |
| 841.5816 | 0.002 |
| 841.8183 | 0.002 |
| 842.05493 | 0.003 |
| 842.29163 | 0.002 |
| 842.52826 | 0.004 |
| 842.76495 | 0 |
| 843.00165 | 0.002 |
| 843.23834 | 0 |
| 843.4751 | 0.002 |
| 843.71179 | 0.001 |
| 843.94855 | 0.003 |
| 844.1853 | 0 |
| 844.422 | 0.003 |
| 844.65881 | 0.001 |
| 844.89557 | 0.002 |
| 845.13232 | 0 |
| 845.36914 | 0.003 |
| 845.6059 | 0.001 |
| 845.84271 | 0.003 |
| 846.07953 | 0.001 |
| 846.31635 | 0.005 |
| 846.55322 | 0.002 |
| 846.79004 | 0.003 |
| 847.02692 | 0.001 |
| 847.26379 | 0.003 |
| 847.50061 | 0 |
| 847.73755 | 0.005 |
| 847.97443 | 0.002 |
| 848.2113 | 0.003 |
| 848.44824 | -0.001 |
| 848.68512 | 0.002 |
| 848.92206 | 0.002 |
| 849.159 | 0.004 |
| 849.39594 | 0.001 |
| 849.63293 | 0.002 |
| 849.86987 | 0.001 |
| 850.10687 | 0.002 |
| 850.34381 | 0 |
| 850.58081 | 0.002 |
| 850.81781 | 0 |
| 851.05481 | 0.004 |
| 851.29187 | 0.001 |
| 851.52887 | 0.002 |
| 851.76593 | 0.003 |
| 852.00299 | 0.002 |
| 852.24005 | -0.001 |
| 852.47711 | 0.004 |
| 852.71417 | 0.002 |
| 852.95129 | 0.005 |
| 853.18835 | 0 |
| 853.42548 | 0.004 |
| 853.6626 | 0.001 |
| 853.89972 | 0.003 |
| 854.13684 | 0 |
| 854.37396 | 0.003 |
| 854.61114 | 0 |
| 854.84827 | 0.003 |
| 855.08545 | 0 |
| 855.32263 | 0.004 |
| 855.55981 | 0.002 |
| 855.797 | 0.004 |
| 856.03424 | -0.002 |
| 856.27142 | 0.001 |
| 856.50867 | 0 |
| 856.74591 | 0.003 |
| 856.98315 | 0.004 |
| 857.2204 | 0.002 |
| 857.45764 | 0 |
| 857.69495 | 0.002 |
| 857.93219 | 0.002 |
| 858.16949 | 0.006 |
| 858.4068 | 0.002 |
| 858.6441 | 0.004 |
| 858.88141 | 0.002 |
| 859.11877 | 0.003 |
| 859.35608 | 0.002 |
| 859.59344 | 0.001 |
| 859.83081 | 0 |
| 860.06818 | 0.003 |
| 860.30554 | 0.001 |
| 860.54291 | 0.001 |
| 860.78033 | 0.001 |
| 861.0177 | 0.004 |
| 861.25513 | 0.001 |
| 861.49255 | 0.004 |
| 861.72998 | 0 |
| 861.96741 | 0.004 |
| 862.20483 | 0.001 |
| 862.44232 | 0.003 |
| 862.67981 | 0.002 |
| 862.91724 | 0.003 |
| 863.15472 | 0.002 |
| 863.39221 | 0.003 |
| 863.62976 | 0.002 |
| 863.86725 | 0.002 |
| 864.1048 | 0.002 |
| 864.34229 | 0.002 |
| 864.57983 | -0.001 |
| 864.81738 | 0.003 |
| 865.05499 | -0.001 |
| 865.29254 | 0.005 |
| 865.53009 | 0.002 |
| 865.7677 | 0.002 |
| 866.00531 | 0 |
| 866.24292 | 0.005 |
| 866.48053 | 0.001 |
| 866.71814 | 0.003 |
| 866.95575 | 0.002 |
| 867.19342 | 0.005 |
| 867.43109 | 0.001 |
| 867.6687 | 0.001 |
| 867.90637 | 0.001 |
| 868.1441 | 0.002 |
| 868.38177 | -0.001 |
| 868.61945 | 0.002 |
| 868.85718 | -0.001 |
| 869.09491 | 0.004 |
| 869.33264 | -0.001 |
| 869.57037 | 0.007 |
| 869.80811 | 0 |
| 870.04584 | 0.005 |
| 870.28363 | 0.001 |
| 870.52136 | 0.003 |
| 870.75916 | 0 |
| 870.99695 | 0.003 |
| 871.23474 | 0.002 |
| 871.4726 | 0.002 |
| 871.71039 | 0.006 |
| 871.94824 | 0.005 |
| 872.18604 | 0.002 |
| 872.42389 | 0.003 |
| 872.66174 | 0.001 |
| 872.8996 | 0 |
| 873.13751 | -0.001 |
| 873.37537 | 0.004 |
| 873.61328 | 0.001 |
| 873.8512 | 0.003 |
| 874.08905 | 0 |
| 874.32703 | 0.002 |
| 874.56494 | 0.002 |
| 874.80286 | 0.003 |
| 875.04083 | -0.002 |
| 875.27875 | 0.001 |
| 875.51672 | 0.003 |
| 875.7547 | -0.002 |
| 875.99268 | 0.002 |
| 876.23071 | 0 |
| 876.46869 | 0.004 |
| 876.70673 | 0.003 |
| 876.94476 | 0.002 |
| 877.18274 | 0.002 |
| 877.42084 | 0.002 |
| 877.65887 | 0.002 |
| 877.89691 | 0.004 |
| 878.13501 | 0.002 |
| 878.37305 | 0.003 |
| 878.61114 | 0 |
| 878.84924 | 0.004 |
| 879.08734 | -0.001 |
| 879.32544 | 0.001 |
| 879.5636 | 0.001 |
| 879.8017 | 0.004 |
| 880.03986 | 0.001 |
| 880.27802 | 0.001 |
| 880.51617 | -0.001 |
| 880.75433 | 0.005 |
| 880.99255 | 0.001 |
| 881.23071 | 0.001 |
| 881.46893 | 0.001 |
| 881.70709 | 0.004 |
| 881.94531 | 0.004 |
| 882.18353 | 0.002 |
| 882.42181 | 0.001 |
| 882.66003 | 0.001 |
| 882.89832 | 0.001 |
| 883.13654 | 0.004 |
| 883.37482 | 0 |
| 883.6131 | 0.003 |
| 883.85138 | 0.003 |
| 884.08972 | 0.002 |
| 884.328 | 0.001 |
| 884.56635 | 0.002 |
| 884.80463 | 0.002 |
| 885.04297 | 0.001 |
| 885.28131 | -0.003 |
| 885.51971 | 0.002 |
| 885.75806 | 0 |
| 885.9964 | 0.006 |
| 886.2348 | -0.002 |
| 886.47321 | 0.001 |
| 886.71161 | 0.004 |
| 886.95001 | 0.004 |
| 887.18842 | -0.002 |
| 887.42688 | 0.005 |
| 887.66528 | 0.001 |
| 887.90375 | 0.005 |
| 888.14221 | 0.002 |
| 888.38068 | 0.005 |
| 888.61914 | 0.002 |
| 888.85761 | 0.004 |
| 889.09613 | -0.001 |
| 889.33459 | 0.004 |
| 889.57312 | -0.001 |
| 889.81165 | 0.005 |
| 890.05017 | 0 |
| 890.2887 | 0.001 |
| 890.52728 | -0.002 |
| 890.76581 | 0 |
| 891.00439 | 0.001 |
| 891.24298 | 0.003 |
| 891.48157 | 0 |
| 891.72015 | 0.005 |
| 891.95874 | -0.001 |
| 892.19739 | 0.004 |
| 892.43597 | -0.001 |
| 892.67462 | 0.005 |
| 892.91327 | -0.001 |
| 893.15192 | 0.004 |
| 893.39056 | -0.002 |
| 893.62921 | 0.006 |
| 893.86792 | -0.001 |
| 894.10663 | 0.001 |
| 894.34528 | 0.001 |
| 894.58398 | 0.001 |
| 894.82269 | 0.003 |
| 895.06146 | 0.004 |
| 895.30017 | 0.001 |
| 895.53894 | 0.006 |
| 895.77765 | 0.001 |
| 896.01642 | 0.001 |
| 896.25519 | 0.002 |
| 896.49396 | 0.001 |
| 896.73279 | -0.002 |
| 896.97156 | 0 |
| 897.21039 | -0.001 |
| 897.44916 | 0.002 |
| 897.68799 | 0.003 |
| 897.92682 | 0.004 |
| 898.16571 | -0.001 |
| 898.40454 | 0.001 |
| 898.64337 | -0.002 |
| 898.88226 | 0.002 |
| 899.12115 | 0 |
| 899.36005 | 0.002 |
| 899.59894 | -0.002 |
| 899.83783 | 0.004 |
| 900.07678 | -0.001 |
| 900.31567 | 0 |
| 900.55463 | 0 |
| 900.79358 | 0 |
| 901.03253 | 0 |
| 901.27148 | 0 |
| 901.51044 | 0 |
| 901.74945 | 0 |
| 901.9884 | 0 |
| 902.22742 | 0 |
| 902.46643 | 0 |
| 902.70544 | 0 |
| 902.94446 | 0 |
| 903.18353 | 0 |
| 903.42255 | 0 |
| 903.66162 | 0 |
| 903.9007 | 0 |
| 904.13977 | 0 |
| 904.37885 | 0 |
| 904.61792 | 0 |
| 904.85706 | 0 |
| 905.09613 | 0 |
| 905.33527 | 0 |
| 905.5744 | 0 |
| 905.81354 | 0 |
| 906.05267 | 0 |
| 906.29181 | 0 |
| 906.53101 | 0 |
| 906.77014 | 0 |
| 907.00934 | 0 |
| 907.24854 | 0 |
| 907.48773 | 0 |
| 907.72693 | 0 |
| 907.96619 | 0 |
| 908.20538 | 0 |
| 908.44464 | 0 |
| 908.6839 | 0 |
| 908.92316 | 0 |
| 909.16241 | 0 |
| 909.40167 | 0 |
| 909.64099 | 0 |
| 909.88025 | 0 |
| 910.11957 | 0 |
| 910.35889 | 0 |
| 910.59821 | 0 |
| 910.83752 | 0 |
| 911.07684 | 0 |
| 911.31622 | 0 |
| 911.5556 | 0 |
| 911.79492 | 0 |
| 912.0343 | 0 |
| 912.27368 | 0 |
| 912.51312 | 0 |
| 912.7525 | 0 |
| 912.99194 | 0 |
| 913.23132 | 0 |
| 913.47076 | 0 |
| 913.71021 | 0 |
| 913.94965 | 0 |
| 914.18915 | 0 |
| 914.42859 | 0 |
| 914.66809 | 0 |
| 914.90753 | 0 |
| 915.14703 | 0 |
| 915.38654 | 0 |
| 915.6261 | 0 |
| 915.8656 | 0 |
| 916.1051 | 0 |
| 916.34467 | 0 |
| 916.58423 | 0 |
| 916.82379 | 0 |
| 917.06335 | 0 |
| 917.30292 | 0 |
| 917.54248 | 0 |
| 917.7821 | 0 |
| 918.02173 | 0 |
| 918.26135 | 0 |
| 918.50098 | 0 |
| 918.7406 | 0 |
| 918.98022 | 0 |
| 919.21985 | 0 |
| 919.45953 | 0 |
| 919.69922 | 0 |
| 919.9389 | 0 |
| 920.17859 | 0 |
| 920.41827 | 0 |
| 920.65796 | 0 |
| 920.89771 | 0 |
| 921.13739 | 0 |
| 921.37714 | 0 |
| 921.61688 | 0 |
| 921.85663 | 0 |
| 922.09644 | 0 |
| 922.33618 | 0 |
| 922.57599 | 0 |
| 922.81573 | 0 |
| 923.05554 | 0 |
| 923.29535 | 0 |
| 923.53516 | 0 |
| 923.77502 | 0 |
| 924.01483 | 0 |
| 924.2547 | 0 |
| 924.49451 | 0 |
| 924.73438 | 0 |
| 924.97424 | 0 |
| 925.21417 | 0 |
| 925.45404 | 0 |
| 925.69391 | 0 |
| 925.93384 | 0 |
| 926.17377 | 0 |
| 926.4137 | 0 |
| 926.65363 | 0 |
| 926.89355 | 0 |
| 927.13354 | 0 |
| 927.37347 | 0 |
| 927.61346 | 0 |
| 927.85345 | 0 |
| 928.09344 | 0 |
| 928.33344 | 0 |
| 928.57343 | 0 |
| 928.81348 | 0 |
| 929.05347 | 0 |
| 929.29352 | 0 |
| 929.53357 | 0 |
| 929.77362 | 0 |
| 930.01367 | 0 |
| 930.25372 | 0 |
| 930.49384 | 0 |
| 930.73395 | 0 |
| 930.974 | 0 |
| 931.21411 | 0 |
| 931.45422 | 0 |
| 931.6944 | 0 |
| 931.93451 | 0 |
| 932.17468 | 0 |
| 932.41479 | 0 |
| 932.65497 | 0 |
| 932.89514 | 0 |
| 933.13531 | 0 |
| 933.37555 | 0 |
| 933.61572 | 0 |
| 933.85596 | 0 |
| 934.09613 | 0 |
| 934.33636 | 0 |
| 934.5766 | 0 |
| 934.81683 | 0 |
| 935.05713 | 0 |
| 935.29736 | 0 |
| 935.53766 | 0 |
| 935.77795 | 0 |
| 936.01825 | 0 |
| 936.25854 | 0 |
| 936.49884 | 0 |
| 936.73914 | 0 |
| 936.97949 | 0 |
| 937.21985 | 0 |
| 937.46014 | 0 |
| 937.7005 | 0 |
| 937.94092 | 0 |
| 938.18127 | 0 |
| 938.42163 | 0 |
| 938.66205 | 0 |
| 938.90247 | 0 |
| 939.14288 | 0 |
| 939.3833 | 0 |
| 939.62372 | 0 |
| 939.86414 | 0 |
| 940.10461 | 0 |
| 940.34503 | 0 |
| 940.58551 | 0 |
| 940.82599 | 0 |
| 941.06647 | 0 |
| 941.30695 | 0 |
| 941.54749 | 0 |
| 941.78796 | 0 |
| 942.0285 | 0 |
| 942.26904 | 0 |
| 942.50958 | 0 |
| 942.75012 | 0 |
| 942.99066 | 0 |
| 943.23126 | 0 |
| 943.4718 | 0 |
| 943.7124 | 0 |
| 943.953 | 0 |
| 944.1936 | 0 |
| 944.4342 | 0 |
| 944.6748 | 0 |
| 944.91547 | 0 |
| 945.15607 | 0 |
| 945.39673 | 0 |
| 945.63739 | 0 |
| 945.87805 | 0 |
| 946.11871 | 0 |
| 946.35944 | 0 |
| 946.6001 | 0 |
| 946.84082 | 0 |
| 947.08154 | 0 |
| 947.32227 | 0 |
| 947.56299 | 0 |
| 947.80371 | 0 |
| 948.04443 | 0 |
| 948.28522 | 0 |
| 948.526 | 0 |
| 948.76678 | 0 |
| 949.00757 | 0 |
| 949.24835 | 0 |
| 949.48914 | 0 |
| 949.72998 | 0 |
| 949.97076 | 0 |
| 950.21161 | 0 |
| 950.45245 | 0 |
| 950.6933 | 0 |
| 950.93414 | 0 |
| 951.17499 | 0 |
| 951.41589 | 0 |
| 951.6568 | 0 |
| 951.89764 | 0 |
| 952.13855 | 0 |
| 952.37946 | 0 |
| 952.62042 | 0 |
| 952.86133 | 0 |
| 953.10229 | 0 |
| 953.3432 | 0 |
| 953.58417 | 0 |
| 953.82513 | 0 |
| 954.0661 | 0 |
| 954.30713 | 0 |
| 954.5481 | 0 |
| 954.78912 | 0 |
| 955.03009 | 0 |
| 955.27112 | 0 |
| 955.51215 | 0 |
| 955.75323 | 0 |
| 955.99426 | 0 |
| 956.23529 | 0 |
| 956.47638 | 0 |
| 956.71747 | 0 |
| 956.95856 | 0 |
| 957.19965 | 0 |
| 957.44073 | 0 |
| 957.68182 | 0 |
| 957.92297 | 0 |
| 958.16412 | 0 |
| 958.40521 | 0 |
| 958.64636 | 0 |
| 958.88757 | 0 |
| 959.12872 | 0 |
| 959.36987 | 0 |
| 959.61108 | 0 |
| 959.85229 | 0 |
| 960.09344 | 0 |
| 960.33466 | 0 |
| 960.57593 | 0 |
| 960.81714 | 0 |
| 961.05835 | 0 |
| 961.29962 | 0 |
| 961.54089 | 0 |
| 961.78217 | 0 |
| 962.02344 | 0 |
| 962.26471 | 0 |
| 962.50598 | 0 |
| 962.74731 | 0 |
| 962.98859 | 0 |
| 963.22992 | 0 |
| 963.47125 | 0 |
| 963.71259 | 0 |
| 963.95398 | 0 |
| 964.19531 | 0 |
| 964.43671 | 0 |
| 964.67804 | 0 |
| 964.91943 | 0 |
| 965.16083 | 0 |
| 965.40222 | 0 |
| 965.64362 | 0 |
| 965.88507 | 0 |
| 966.12653 | 0 |
| 966.36792 | 0 |
| 966.60938 | 0 |
| 966.85083 | 0 |
| 967.09229 | 0 |
| 967.3338 | 0 |
| 967.57526 | 0 |
| 967.81677 | 0 |
| 968.05829 | 0 |
| 968.2998 | 0 |
| 968.54132 | 0 |
| 968.78284 | 0 |
| 969.02435 | 0 |
| 969.26593 | 0 |
| 969.50745 | 0 |
| 969.74902 | 0 |
| 969.9906 | 0 |
| 970.23218 | 0 |
| 970.47382 | 0 |
| 970.71539 | 0 |
| 970.95703 | 0 |
| 971.19861 | 0 |
| 971.44025 | 0 |
| 971.68188 | 0 |
| 971.92352 | 0 |
| 972.16522 | 0 |
| 972.40686 | 0 |
| 972.64856 | 0 |
| 972.8902 | 0 |
| 973.1319 | 0 |
| 973.3736 | 0 |
| 973.6153 | 0 |
| 973.85706 | 0 |
| 974.09875 | 0 |
| 974.34052 | 0 |
| 974.58228 | 0 |
| 974.82404 | 0 |
| 975.0658 | 0 |
| 975.30756 | 0 |
| 975.54932 | 0 |
| 975.79114 | 0 |
| 976.03296 | 0 |
| 976.27472 | 0 |
| 976.51654 | 0 |
| 976.75842 | 0 |
| 977.00024 | 0 |
| 977.24207 | 0 |
| 977.48395 | 0 |
| 977.72583 | 0 |
| 977.96765 | 0 |
| 978.20953 | 0 |
| 978.45148 | 0 |
| 978.69336 | 0 |
| 978.93524 | 0 |
| 979.17719 | 0 |
| 979.41913 | 0 |
| 979.66107 | 0 |
| 979.90302 | 0 |
| 980.14496 | 0 |
| 980.3869 | 0 |
| 980.62891 | 0 |
| 980.87085 | 0 |
| 981.11285 | 0 |
| 981.35486 | 0 |
| 981.59686 | 0 |
| 981.83887 | 0 |
| 982.08093 | 0 |
| 982.32294 | 0 |
| 982.565 | 0 |
| 982.80707 | 0 |
| 983.04913 | 0 |
| 983.2912 | 0 |
| 983.53326 | 0 |
| 983.77539 | 0 |
| 984.01746 | 0 |
| 984.25958 | 0 |
| 984.50171 | 0 |
| 984.74384 | 0 |
| 984.98596 | 0 |
| 985.22809 | 0 |
| 985.47028 | 0 |
| 985.7124 | 0 |
| 985.95459 | 0 |
| 986.19678 | 0 |
| 986.43896 | 0 |
| 986.68115 | 0 |
| 986.9234 | 0 |
| 987.16559 | 0 |
| 987.40784 | 0 |
| 987.65009 | 0 |
| 987.89233 | 0 |
| 988.13458 | 0 |
| 988.37683 | 0 |
| 988.61908 | 0 |
| 988.86139 | 0 |
| 989.1037 | 0 |
| 989.34595 | 0 |
| 989.58826 | 0 |
| 989.83057 | 0 |
| 990.07294 | 0 |
| 990.31525 | 0 |
| 990.55762 | 0 |
| 990.79993 | 0 |
| 991.0423 | 0 |
| 991.28467 | 0 |
| 991.52704 | 0 |
| 991.76947 | 0 |
| 992.01184 | 0 |
| 992.25427 | 0 |
| 992.4967 | 0 |
| 992.73914 | 0 |
| 992.98157 | 0 |
| 993.224 | 0 |
| 993.46643 | 0 |
| 993.70892 | 0 |
| 993.95136 | 0 |
| 994.19385 | 0 |
| 994.43634 | 0 |
| 994.67883 | 0 |
| 994.92133 | 0 |
| 995.16388 | 0 |
| 995.40637 | 0 |
| 995.64893 | 0 |
| 995.89148 | 0 |
| 996.13403 | 0 |
| 996.37659 | 0 |
| 996.61914 | 0 |
| 996.86169 | 0 |
| 997.10431 | 0 |
| 997.34692 | 0 |
| 997.58954 | 0 |
| 997.83215 | 0 |
| 998.07477 | 0 |
| 998.31738 | 0 |
| 998.56006 | 0 |
| 998.80267 | 0 |
| 999.04535 | 0 |
| 999.28802 | 0 |
| 999.5307 | 0 |
| 999.77338 | 0 |
| 1000.01605 | 0 |
| 1000.25879 | 0 |
| 1000.50147 | 0 |
| 1000.7442 | 0 |
| 1000.98694 | 0 |
| 1001.22968 | 0 |
| 1001.47241 | 0 |
| 1001.71521 | 0 |
| 1001.95795 | 0 |
| 1002.20075 | 0 |
| 1002.44354 | 0 |
| 1002.68634 | 0 |
| 1002.92914 | 0 |
| 1003.17194 | 0 |
| 1003.41473 | 0 |
| 1003.65759 | 0 |
| 1003.90045 | 0 |
| 1004.14331 | 0 |
| 1004.38617 | 0 |
| 1004.62903 | 0 |
| 1004.87189 | 0 |
| 1005.11475 | 0 |
| 1005.35767 | 0 |
| 1005.60059 | 0 |
| 1005.84351 | 0 |
| 1006.08643 | 0 |
| 1006.32935 | 0 |
| 1006.57227 | 0 |
| 1006.81525 | 0 |
| 1007.05817 | 0 |
| 1007.30115 | 0 |
| 1007.54413 | 0 |
| 1007.78711 | 0 |
| 1008.03009 | 0 |
| 1008.27313 | 0 |
| 1008.51611 | 0 |
| 1008.75916 | 0 |
| 1009.00214 | 0 |
| 1009.24518 | 0 |
| 1009.48822 | 0 |
| 1009.73132 | 0 |
| 1009.97437 | 0 |
| 1010.21747 | 0 |
| 1010.46051 | 0 |
| 1010.70361 | 0 |
| 1010.94672 | 0 |
| 1011.18982 | 0 |
| 1011.43292 | 0 |
| 1011.67609 | 0 |
| 1011.91919 | 0 |
| 1012.16235 | 0 |
| 1012.40552 | 0 |
| 1012.64868 | 0 |
| 1012.89185 | 0 |
| 1013.13501 | 0 |
| 1013.37824 | 0 |
| 1013.62146 | 0 |
| 1013.86462 | 0 |
| 1014.10785 | 0 |
| 1014.35107 | 0 |
| 1014.5943 | 0 |
| 1014.83759 | 0 |
| 1015.08081 | 0 |
| 1015.3241 | 0 |
| 1015.56738 | 0 |
| 1015.81061 | 0 |
| 1016.05396 | 0 |
| 1016.29724 | 0 |
| 1016.54053 | 0 |
| 1016.78388 | 0 |
| 1017.02716 | 0 |
| 1017.27051 | 0 |
| 1017.51386 | 0 |
| 1017.7572 | 0 |
| 1018.00055 | 0 |
| 1018.24396 | 0 |
| 1018.48731 | 0 |
| 1018.73071 | 0 |
| 1018.97412 | 0 |
| 1019.21753 | 0 |
| 1019.46094 | 0 |
| 1019.70435 | 0 |
| 1019.94782 | 0 |
| 1020.19122 | 0 |
| 1020.43469 | 0 |
| 1020.67816 | 0 |
| 1020.92163 | 0 |
| 1021.1651 | 0 |
| 1021.40857 | 0 |